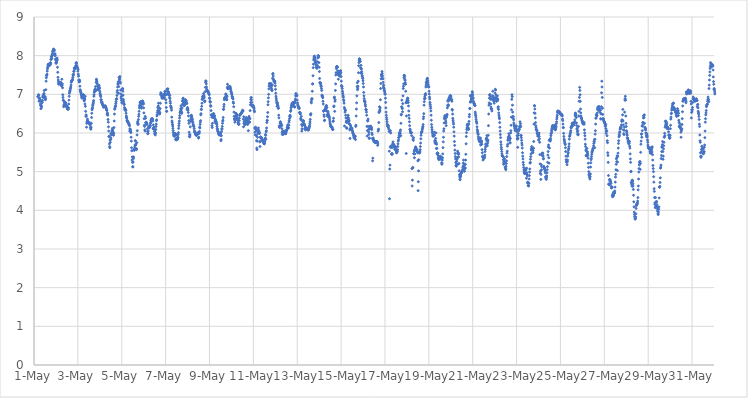
| Category | Series 0 |
|---|---|
| 44317.166666666664 | 6.94 |
| 44317.208333333336 | 6.99 |
| 44317.21875 | 6.98 |
| 44317.229166666664 | 6.82 |
| 44317.239583333336 | 6.89 |
| 44317.25 | 6.91 |
| 44317.260416666664 | 6.85 |
| 44317.270833333336 | 6.83 |
| 44317.28125 | 6.86 |
| 44317.291666666664 | 6.75 |
| 44317.302083333336 | 6.71 |
| 44317.3125 | 6.63 |
| 44317.322916666664 | 6.72 |
| 44317.333333333336 | 6.65 |
| 44317.34375 | 6.69 |
| 44317.354166666664 | 6.78 |
| 44317.364583333336 | 6.83 |
| 44317.375 | 6.79 |
| 44317.385416666664 | 6.84 |
| 44317.395833333336 | 6.93 |
| 44317.40625 | 6.93 |
| 44317.416666666664 | 6.97 |
| 44317.427083333336 | 6.93 |
| 44317.4375 | 6.96 |
| 44317.447916666664 | 7.01 |
| 44317.458333333336 | 7.02 |
| 44317.46875 | 7.1 |
| 44317.479166666664 | 6.93 |
| 44317.489583333336 | 6.89 |
| 44317.5 | 6.91 |
| 44317.510416666664 | 6.94 |
| 44317.520833333336 | 6.86 |
| 44317.53125 | 6.89 |
| 44317.541666666664 | 7.12 |
| 44317.552083333336 | 7.34 |
| 44317.5625 | 7.43 |
| 44317.572916666664 | 7.48 |
| 44317.583333333336 | 7.5 |
| 44317.59375 | 7.52 |
| 44317.604166666664 | 7.6 |
| 44317.614583333336 | 7.66 |
| 44317.625 | 7.7 |
| 44317.635416666664 | 7.73 |
| 44317.645833333336 | 7.77 |
| 44317.65625 | 7.78 |
| 44317.666666666664 | 7.77 |
| 44317.677083333336 | 7.76 |
| 44317.6875 | 7.78 |
| 44317.697916666664 | 7.76 |
| 44317.708333333336 | 7.75 |
| 44317.71875 | 7.76 |
| 44317.729166666664 | 7.76 |
| 44317.739583333336 | 7.77 |
| 44317.75 | 7.82 |
| 44317.760416666664 | 7.8 |
| 44317.770833333336 | 7.9 |
| 44317.78125 | 7.91 |
| 44317.791666666664 | 7.97 |
| 44317.802083333336 | 7.98 |
| 44317.8125 | 7.93 |
| 44317.822916666664 | 8 |
| 44317.833333333336 | 8.03 |
| 44317.84375 | 8.06 |
| 44317.854166666664 | 8.12 |
| 44317.864583333336 | 8.11 |
| 44317.875 | 8.14 |
| 44317.885416666664 | 8.17 |
| 44317.895833333336 | 8.14 |
| 44317.90625 | 8.16 |
| 44317.916666666664 | 8.15 |
| 44317.927083333336 | 8.13 |
| 44317.9375 | 8.01 |
| 44317.947916666664 | 8.04 |
| 44317.958333333336 | 8.05 |
| 44317.96875 | 8 |
| 44317.979166666664 | 7.91 |
| 44317.989583333336 | 7.89 |
| 44318.0 | 7.82 |
| 44318.010416666664 | 7.8 |
| 44318.020833333336 | 7.82 |
| 44318.03125 | 7.85 |
| 44318.041666666664 | 7.91 |
| 44318.052083333336 | 7.94 |
| 44318.0625 | 7.89 |
| 44318.072916666664 | 7.7 |
| 44318.083333333336 | 7.57 |
| 44318.09375 | 7.44 |
| 44318.104166666664 | 7.37 |
| 44318.114583333336 | 7.32 |
| 44318.125 | 7.27 |
| 44318.135416666664 | 7.26 |
| 44318.145833333336 | 7.29 |
| 44318.15625 | 7.3 |
| 44318.166666666664 | 7.31 |
| 44318.177083333336 | 7.31 |
| 44318.1875 | 7.3 |
| 44318.197916666664 | 7.3 |
| 44318.208333333336 | 7.3 |
| 44318.21875 | 7.31 |
| 44318.229166666664 | 7.27 |
| 44318.239583333336 | 7.24 |
| 44318.25 | 7.22 |
| 44318.260416666664 | 7.25 |
| 44318.270833333336 | 7.39 |
| 44318.28125 | 7.23 |
| 44318.291666666664 | 7.27 |
| 44318.302083333336 | 7.17 |
| 44318.3125 | 6.99 |
| 44318.322916666664 | 6.92 |
| 44318.333333333336 | 6.85 |
| 44318.34375 | 6.84 |
| 44318.354166666664 | 6.68 |
| 44318.364583333336 | 6.71 |
| 44318.375 | 6.74 |
| 44318.385416666664 | 6.81 |
| 44318.395833333336 | 6.76 |
| 44318.40625 | 6.8 |
| 44318.416666666664 | 6.79 |
| 44318.427083333336 | 6.78 |
| 44318.4375 | 6.78 |
| 44318.447916666664 | 6.78 |
| 44318.458333333336 | 6.73 |
| 44318.46875 | 6.71 |
| 44318.479166666664 | 6.68 |
| 44318.489583333336 | 6.68 |
| 44318.5 | 6.69 |
| 44318.510416666664 | 6.69 |
| 44318.520833333336 | 6.63 |
| 44318.53125 | 6.63 |
| 44318.541666666664 | 6.62 |
| 44318.552083333336 | 6.61 |
| 44318.5625 | 6.62 |
| 44318.572916666664 | 6.65 |
| 44318.583333333336 | 6.75 |
| 44318.59375 | 6.85 |
| 44318.604166666664 | 6.95 |
| 44318.614583333336 | 7.03 |
| 44318.625 | 7.06 |
| 44318.635416666664 | 7.09 |
| 44318.645833333336 | 7.09 |
| 44318.65625 | 7.14 |
| 44318.666666666664 | 7.16 |
| 44318.677083333336 | 7.19 |
| 44318.6875 | 7.24 |
| 44318.697916666664 | 7.31 |
| 44318.708333333336 | 7.34 |
| 44318.71875 | 7.36 |
| 44318.729166666664 | 7.36 |
| 44318.739583333336 | 7.36 |
| 44318.75 | 7.37 |
| 44318.760416666664 | 7.39 |
| 44318.770833333336 | 7.44 |
| 44318.78125 | 7.51 |
| 44318.791666666664 | 7.49 |
| 44318.802083333336 | 7.52 |
| 44318.8125 | 7.59 |
| 44318.822916666664 | 7.6 |
| 44318.833333333336 | 7.68 |
| 44318.84375 | 7.68 |
| 44318.854166666664 | 7.65 |
| 44318.864583333336 | 7.66 |
| 44318.875 | 7.69 |
| 44318.885416666664 | 7.7 |
| 44318.895833333336 | 7.69 |
| 44318.90625 | 7.74 |
| 44318.916666666664 | 7.8 |
| 44318.927083333336 | 7.82 |
| 44318.9375 | 7.81 |
| 44318.947916666664 | 7.75 |
| 44318.958333333336 | 7.72 |
| 44318.96875 | 7.69 |
| 44318.979166666664 | 7.69 |
| 44318.989583333336 | 7.67 |
| 44319.0 | 7.6 |
| 44319.010416666664 | 7.64 |
| 44319.020833333336 | 7.52 |
| 44319.03125 | 7.47 |
| 44319.041666666664 | 7.37 |
| 44319.052083333336 | 7.32 |
| 44319.0625 | 7.35 |
| 44319.072916666664 | 7.37 |
| 44319.083333333336 | 7.33 |
| 44319.09375 | 7.21 |
| 44319.104166666664 | 7.12 |
| 44319.114583333336 | 7.09 |
| 44319.125 | 7.07 |
| 44319.135416666664 | 7.05 |
| 44319.145833333336 | 7.01 |
| 44319.15625 | 6.99 |
| 44319.166666666664 | 6.96 |
| 44319.177083333336 | 6.92 |
| 44319.1875 | 6.9 |
| 44319.197916666664 | 6.94 |
| 44319.208333333336 | 6.97 |
| 44319.21875 | 6.98 |
| 44319.229166666664 | 6.98 |
| 44319.239583333336 | 6.99 |
| 44319.25 | 6.99 |
| 44319.260416666664 | 6.98 |
| 44319.270833333336 | 6.91 |
| 44319.28125 | 6.85 |
| 44319.291666666664 | 6.83 |
| 44319.302083333336 | 6.9 |
| 44319.3125 | 6.87 |
| 44319.322916666664 | 6.75 |
| 44319.333333333336 | 6.95 |
| 44319.34375 | 6.69 |
| 44319.354166666664 | 6.56 |
| 44319.364583333336 | 6.43 |
| 44319.375 | 6.47 |
| 44319.385416666664 | 6.44 |
| 44319.395833333336 | 6.15 |
| 44319.40625 | 6.25 |
| 44319.416666666664 | 6.29 |
| 44319.427083333336 | 6.31 |
| 44319.4375 | 6.36 |
| 44319.447916666664 | 6.31 |
| 44319.458333333336 | 6.3 |
| 44319.46875 | 6.26 |
| 44319.479166666664 | 6.26 |
| 44319.489583333336 | 6.26 |
| 44319.5 | 6.26 |
| 44319.510416666664 | 6.26 |
| 44319.520833333336 | 6.26 |
| 44319.53125 | 6.27 |
| 44319.541666666664 | 6.24 |
| 44319.552083333336 | 6.23 |
| 44319.5625 | 6.21 |
| 44319.572916666664 | 6.15 |
| 44319.583333333336 | 6.11 |
| 44319.59375 | 6.1 |
| 44319.604166666664 | 6.15 |
| 44319.614583333336 | 6.25 |
| 44319.625 | 6.4 |
| 44319.635416666664 | 6.51 |
| 44319.645833333336 | 6.6 |
| 44319.65625 | 6.63 |
| 44319.666666666664 | 6.66 |
| 44319.677083333336 | 6.71 |
| 44319.6875 | 6.73 |
| 44319.697916666664 | 6.77 |
| 44319.708333333336 | 6.8 |
| 44319.71875 | 6.84 |
| 44319.729166666664 | 6.95 |
| 44319.739583333336 | 6.99 |
| 44319.75 | 7.05 |
| 44319.760416666664 | 7.08 |
| 44319.770833333336 | 7.11 |
| 44319.78125 | 7.12 |
| 44319.791666666664 | 7.14 |
| 44319.802083333336 | 7.2 |
| 44319.8125 | 7.1 |
| 44319.822916666664 | 7.1 |
| 44319.833333333336 | 7.31 |
| 44319.84375 | 7.39 |
| 44319.854166666664 | 7.37 |
| 44319.864583333336 | 7.34 |
| 44319.875 | 7.29 |
| 44319.885416666664 | 7.27 |
| 44319.895833333336 | 7.21 |
| 44319.90625 | 7.12 |
| 44319.916666666664 | 7.14 |
| 44319.927083333336 | 7.13 |
| 44319.9375 | 7.18 |
| 44319.947916666664 | 7.14 |
| 44319.958333333336 | 7.18 |
| 44319.96875 | 7.23 |
| 44319.979166666664 | 7.18 |
| 44319.989583333336 | 7.15 |
| 44320.0 | 7.08 |
| 44320.010416666664 | 7.03 |
| 44320.020833333336 | 6.99 |
| 44320.03125 | 6.97 |
| 44320.041666666664 | 6.94 |
| 44320.052083333336 | 6.86 |
| 44320.0625 | 6.86 |
| 44320.072916666664 | 6.79 |
| 44320.083333333336 | 6.79 |
| 44320.09375 | 6.8 |
| 44320.104166666664 | 6.8 |
| 44320.114583333336 | 6.76 |
| 44320.125 | 6.74 |
| 44320.135416666664 | 6.72 |
| 44320.145833333336 | 6.72 |
| 44320.15625 | 6.7 |
| 44320.166666666664 | 6.68 |
| 44320.177083333336 | 6.67 |
| 44320.1875 | 6.67 |
| 44320.197916666664 | 6.68 |
| 44320.208333333336 | 6.7 |
| 44320.21875 | 6.69 |
| 44320.229166666664 | 6.69 |
| 44320.239583333336 | 6.68 |
| 44320.25 | 6.69 |
| 44320.260416666664 | 6.7 |
| 44320.270833333336 | 6.67 |
| 44320.28125 | 6.66 |
| 44320.291666666664 | 6.64 |
| 44320.302083333336 | 6.6 |
| 44320.3125 | 6.6 |
| 44320.322916666664 | 6.58 |
| 44320.333333333336 | 6.48 |
| 44320.34375 | 6.51 |
| 44320.354166666664 | 6.51 |
| 44320.364583333336 | 6.46 |
| 44320.375 | 6.35 |
| 44320.385416666664 | 6.28 |
| 44320.395833333336 | 6.16 |
| 44320.40625 | 6.05 |
| 44320.416666666664 | 5.91 |
| 44320.427083333336 | 5.91 |
| 44320.4375 | 5.72 |
| 44320.447916666664 | 5.65 |
| 44320.458333333336 | 5.62 |
| 44320.46875 | 5.82 |
| 44320.479166666664 | 5.76 |
| 44320.489583333336 | 5.83 |
| 44320.5 | 5.98 |
| 44320.510416666664 | 5.87 |
| 44320.520833333336 | 5.97 |
| 44320.53125 | 5.95 |
| 44320.541666666664 | 5.99 |
| 44320.552083333336 | 6.04 |
| 44320.5625 | 6.07 |
| 44320.572916666664 | 6.12 |
| 44320.583333333336 | 6.08 |
| 44320.59375 | 6.05 |
| 44320.604166666664 | 6.01 |
| 44320.614583333336 | 5.97 |
| 44320.625 | 5.94 |
| 44320.635416666664 | 6 |
| 44320.645833333336 | 6.14 |
| 44320.65625 | 6.31 |
| 44320.666666666664 | 6.49 |
| 44320.677083333336 | 6.62 |
| 44320.6875 | 6.62 |
| 44320.697916666664 | 6.67 |
| 44320.708333333336 | 6.68 |
| 44320.71875 | 6.71 |
| 44320.729166666664 | 6.76 |
| 44320.739583333336 | 6.81 |
| 44320.75 | 6.87 |
| 44320.760416666664 | 6.87 |
| 44320.770833333336 | 6.89 |
| 44320.78125 | 6.97 |
| 44320.791666666664 | 7.05 |
| 44320.802083333336 | 7.1 |
| 44320.8125 | 7.19 |
| 44320.822916666664 | 7.26 |
| 44320.833333333336 | 7.32 |
| 44320.84375 | 7.28 |
| 44320.854166666664 | 7.03 |
| 44320.864583333336 | 7.2 |
| 44320.875 | 7.44 |
| 44320.885416666664 | 7.37 |
| 44320.895833333336 | 7.39 |
| 44320.90625 | 7.42 |
| 44320.916666666664 | 7.46 |
| 44320.927083333336 | 7.32 |
| 44320.9375 | 7.29 |
| 44320.947916666664 | 7.11 |
| 44320.958333333336 | 7.01 |
| 44320.96875 | 6.93 |
| 44320.979166666664 | 6.89 |
| 44320.989583333336 | 6.84 |
| 44321.0 | 6.78 |
| 44321.010416666664 | 6.96 |
| 44321.020833333336 | 7.13 |
| 44321.03125 | 7.14 |
| 44321.041666666664 | 7.15 |
| 44321.052083333336 | 7.08 |
| 44321.0625 | 6.98 |
| 44321.072916666664 | 6.87 |
| 44321.083333333336 | 6.82 |
| 44321.09375 | 6.77 |
| 44321.104166666664 | 6.74 |
| 44321.114583333336 | 6.74 |
| 44321.125 | 6.66 |
| 44321.135416666664 | 6.62 |
| 44321.145833333336 | 6.6 |
| 44321.15625 | 6.59 |
| 44321.166666666664 | 6.61 |
| 44321.177083333336 | 6.61 |
| 44321.1875 | 6.58 |
| 44321.197916666664 | 6.51 |
| 44321.208333333336 | 6.44 |
| 44321.21875 | 6.41 |
| 44321.229166666664 | 6.38 |
| 44321.239583333336 | 6.33 |
| 44321.25 | 6.31 |
| 44321.260416666664 | 6.31 |
| 44321.270833333336 | 6.29 |
| 44321.28125 | 6.28 |
| 44321.291666666664 | 6.28 |
| 44321.302083333336 | 6.26 |
| 44321.3125 | 6.25 |
| 44321.322916666664 | 6.24 |
| 44321.333333333336 | 6.22 |
| 44321.34375 | 6.2 |
| 44321.354166666664 | 6.19 |
| 44321.364583333336 | 6.05 |
| 44321.375 | 6.11 |
| 44321.385416666664 | 6.09 |
| 44321.395833333336 | 6.07 |
| 44321.40625 | 6.04 |
| 44321.416666666664 | 6.01 |
| 44321.427083333336 | 5.89 |
| 44321.4375 | 5.79 |
| 44321.447916666664 | 5.62 |
| 44321.458333333336 | 5.54 |
| 44321.46875 | 5.3 |
| 44321.479166666664 | 5.38 |
| 44321.489583333336 | 5.24 |
| 44321.5 | 5.13 |
| 44321.510416666664 | 5.12 |
| 44321.520833333336 | 5.25 |
| 44321.53125 | 5.34 |
| 44321.541666666664 | 5.38 |
| 44321.552083333336 | 5.57 |
| 44321.5625 | 5.56 |
| 44321.572916666664 | 5.55 |
| 44321.583333333336 | 5.59 |
| 44321.59375 | 5.64 |
| 44321.604166666664 | 5.69 |
| 44321.614583333336 | 5.8 |
| 44321.625 | 5.8 |
| 44321.635416666664 | 5.69 |
| 44321.645833333336 | 5.71 |
| 44321.65625 | 5.59 |
| 44321.666666666664 | 5.57 |
| 44321.677083333336 | 5.59 |
| 44321.6875 | 5.75 |
| 44321.697916666664 | 5.95 |
| 44321.708333333336 | 6.06 |
| 44321.71875 | 6.26 |
| 44321.729166666664 | 6.3 |
| 44321.739583333336 | 6.22 |
| 44321.75 | 6.24 |
| 44321.760416666664 | 6.35 |
| 44321.770833333336 | 6.43 |
| 44321.78125 | 6.48 |
| 44321.791666666664 | 6.56 |
| 44321.802083333336 | 6.65 |
| 44321.8125 | 6.7 |
| 44321.822916666664 | 6.72 |
| 44321.833333333336 | 6.78 |
| 44321.84375 | 6.8 |
| 44321.854166666664 | 6.79 |
| 44321.864583333336 | 6.81 |
| 44321.875 | 6.8 |
| 44321.885416666664 | 6.77 |
| 44321.895833333336 | 6.64 |
| 44321.90625 | 6.68 |
| 44321.916666666664 | 6.74 |
| 44321.927083333336 | 6.79 |
| 44321.9375 | 6.78 |
| 44321.947916666664 | 6.83 |
| 44321.958333333336 | 6.82 |
| 44321.96875 | 6.76 |
| 44321.979166666664 | 6.78 |
| 44321.989583333336 | 6.75 |
| 44322.0 | 6.65 |
| 44322.010416666664 | 6.52 |
| 44322.020833333336 | 6.37 |
| 44322.03125 | 6.2 |
| 44322.041666666664 | 6.17 |
| 44322.052083333336 | 6.08 |
| 44322.0625 | 6.05 |
| 44322.072916666664 | 6.43 |
| 44322.083333333336 | 6.38 |
| 44322.09375 | 6.27 |
| 44322.104166666664 | 6.26 |
| 44322.114583333336 | 6.28 |
| 44322.125 | 6.27 |
| 44322.135416666664 | 6.23 |
| 44322.145833333336 | 6.24 |
| 44322.15625 | 6.22 |
| 44322.166666666664 | 6.11 |
| 44322.177083333336 | 6.04 |
| 44322.1875 | 5.98 |
| 44322.197916666664 | 5.99 |
| 44322.208333333336 | 6.05 |
| 44322.21875 | 6.14 |
| 44322.229166666664 | 6.15 |
| 44322.239583333336 | 6.15 |
| 44322.25 | 6.13 |
| 44322.260416666664 | 6.17 |
| 44322.270833333336 | 6.17 |
| 44322.28125 | 6.16 |
| 44322.291666666664 | 6.17 |
| 44322.302083333336 | 6.2 |
| 44322.3125 | 6.25 |
| 44322.322916666664 | 6.28 |
| 44322.333333333336 | 6.32 |
| 44322.34375 | 6.36 |
| 44322.354166666664 | 6.36 |
| 44322.364583333336 | 6.36 |
| 44322.375 | 6.34 |
| 44322.385416666664 | 6.36 |
| 44322.395833333336 | 6.37 |
| 44322.40625 | 6.36 |
| 44322.416666666664 | 6.31 |
| 44322.427083333336 | 6.11 |
| 44322.4375 | 6.21 |
| 44322.447916666664 | 6.12 |
| 44322.458333333336 | 6.14 |
| 44322.46875 | 6.15 |
| 44322.479166666664 | 6.1 |
| 44322.489583333336 | 6.04 |
| 44322.5 | 5.98 |
| 44322.510416666664 | 6.05 |
| 44322.520833333336 | 6 |
| 44322.53125 | 5.95 |
| 44322.541666666664 | 6 |
| 44322.552083333336 | 6.09 |
| 44322.5625 | 6.17 |
| 44322.572916666664 | 6.23 |
| 44322.583333333336 | 6.32 |
| 44322.59375 | 6.34 |
| 44322.604166666664 | 6.44 |
| 44322.614583333336 | 6.47 |
| 44322.625 | 6.53 |
| 44322.635416666664 | 6.58 |
| 44322.645833333336 | 6.66 |
| 44322.65625 | 6.67 |
| 44322.666666666664 | 6.7 |
| 44322.677083333336 | 6.77 |
| 44322.6875 | 6.65 |
| 44322.697916666664 | 6.58 |
| 44322.708333333336 | 6.55 |
| 44322.71875 | 6.51 |
| 44322.729166666664 | 6.49 |
| 44322.739583333336 | 6.52 |
| 44322.75 | 6.63 |
| 44322.760416666664 | 6.77 |
| 44322.770833333336 | 6.99 |
| 44322.78125 | 7.04 |
| 44322.791666666664 | 7.03 |
| 44322.802083333336 | 7.01 |
| 44322.8125 | 6.99 |
| 44322.822916666664 | 6.94 |
| 44322.833333333336 | 6.91 |
| 44322.84375 | 6.9 |
| 44322.854166666664 | 6.93 |
| 44322.864583333336 | 6.91 |
| 44322.875 | 6.93 |
| 44322.885416666664 | 6.95 |
| 44322.895833333336 | 6.93 |
| 44322.90625 | 6.95 |
| 44322.916666666664 | 6.9 |
| 44322.927083333336 | 6.99 |
| 44322.9375 | 7 |
| 44322.947916666664 | 6.91 |
| 44322.958333333336 | 7.02 |
| 44322.96875 | 7.07 |
| 44322.979166666664 | 7.08 |
| 44322.989583333336 | 7.03 |
| 44323.0 | 6.98 |
| 44323.010416666664 | 6.86 |
| 44323.020833333336 | 6.78 |
| 44323.03125 | 6.66 |
| 44323.041666666664 | 6.56 |
| 44323.052083333336 | 6.56 |
| 44323.0625 | 7.13 |
| 44323.072916666664 | 7 |
| 44323.083333333336 | 7.08 |
| 44323.09375 | 7.14 |
| 44323.104166666664 | 7.14 |
| 44323.114583333336 | 7.07 |
| 44323.125 | 7.04 |
| 44323.135416666664 | 7.06 |
| 44323.145833333336 | 7.01 |
| 44323.15625 | 7.01 |
| 44323.166666666664 | 6.98 |
| 44323.177083333336 | 6.92 |
| 44323.1875 | 6.97 |
| 44323.197916666664 | 6.89 |
| 44323.208333333336 | 6.82 |
| 44323.21875 | 6.77 |
| 44323.229166666664 | 6.7 |
| 44323.239583333336 | 6.69 |
| 44323.25 | 6.66 |
| 44323.260416666664 | 6.64 |
| 44323.270833333336 | 6.59 |
| 44323.28125 | 6.41 |
| 44323.291666666664 | 6.31 |
| 44323.302083333336 | 6.27 |
| 44323.3125 | 6.22 |
| 44323.322916666664 | 6.18 |
| 44323.333333333336 | 6.12 |
| 44323.34375 | 6.06 |
| 44323.354166666664 | 6.01 |
| 44323.364583333336 | 5.96 |
| 44323.375 | 5.93 |
| 44323.385416666664 | 5.92 |
| 44323.395833333336 | 5.92 |
| 44323.40625 | 5.94 |
| 44323.416666666664 | 5.97 |
| 44323.427083333336 | 5.98 |
| 44323.4375 | 5.99 |
| 44323.447916666664 | 5.95 |
| 44323.458333333336 | 5.83 |
| 44323.46875 | 5.83 |
| 44323.479166666664 | 5.86 |
| 44323.489583333336 | 5.82 |
| 44323.5 | 5.95 |
| 44323.510416666664 | 5.96 |
| 44323.520833333336 | 5.83 |
| 44323.53125 | 5.86 |
| 44323.541666666664 | 5.84 |
| 44323.552083333336 | 5.89 |
| 44323.5625 | 5.88 |
| 44323.572916666664 | 5.96 |
| 44323.583333333336 | 6.01 |
| 44323.59375 | 6.12 |
| 44323.604166666664 | 6.19 |
| 44323.614583333336 | 6.25 |
| 44323.625 | 6.31 |
| 44323.635416666664 | 6.39 |
| 44323.645833333336 | 6.45 |
| 44323.65625 | 6.52 |
| 44323.666666666664 | 6.54 |
| 44323.677083333336 | 6.57 |
| 44323.6875 | 6.63 |
| 44323.697916666664 | 6.7 |
| 44323.708333333336 | 6.6 |
| 44323.71875 | 6.56 |
| 44323.729166666664 | 6.51 |
| 44323.739583333336 | 6.52 |
| 44323.75 | 6.65 |
| 44323.760416666664 | 6.74 |
| 44323.770833333336 | 6.82 |
| 44323.78125 | 6.85 |
| 44323.791666666664 | 6.89 |
| 44323.802083333336 | 6.9 |
| 44323.8125 | 6.81 |
| 44323.822916666664 | 6.77 |
| 44323.833333333336 | 6.73 |
| 44323.84375 | 6.71 |
| 44323.854166666664 | 6.71 |
| 44323.864583333336 | 6.73 |
| 44323.875 | 6.76 |
| 44323.885416666664 | 6.8 |
| 44323.895833333336 | 6.84 |
| 44323.90625 | 6.86 |
| 44323.916666666664 | 6.85 |
| 44323.927083333336 | 6.84 |
| 44323.9375 | 6.83 |
| 44323.947916666664 | 6.79 |
| 44323.958333333336 | 6.78 |
| 44323.96875 | 6.76 |
| 44323.979166666664 | 6.61 |
| 44323.989583333336 | 6.63 |
| 44324.0 | 6.66 |
| 44324.010416666664 | 6.63 |
| 44324.020833333336 | 6.59 |
| 44324.03125 | 6.53 |
| 44324.041666666664 | 6.44 |
| 44324.052083333336 | 6.32 |
| 44324.0625 | 6.25 |
| 44324.072916666664 | 6.02 |
| 44324.083333333336 | 5.91 |
| 44324.09375 | 5.96 |
| 44324.104166666664 | 5.9 |
| 44324.114583333336 | 5.95 |
| 44324.125 | 6.16 |
| 44324.135416666664 | 6.3 |
| 44324.145833333336 | 6.36 |
| 44324.15625 | 6.43 |
| 44324.166666666664 | 6.46 |
| 44324.177083333336 | 6.39 |
| 44324.1875 | 6.45 |
| 44324.197916666664 | 6.4 |
| 44324.208333333336 | 6.34 |
| 44324.21875 | 6.36 |
| 44324.229166666664 | 6.3 |
| 44324.239583333336 | 6.27 |
| 44324.25 | 6.23 |
| 44324.260416666664 | 6.2 |
| 44324.270833333336 | 6.2 |
| 44324.28125 | 6.18 |
| 44324.291666666664 | 6.16 |
| 44324.302083333336 | 6.11 |
| 44324.3125 | 6.05 |
| 44324.322916666664 | 6.02 |
| 44324.333333333336 | 6.01 |
| 44324.34375 | 6.03 |
| 44324.354166666664 | 6 |
| 44324.364583333336 | 5.97 |
| 44324.375 | 5.95 |
| 44324.385416666664 | 5.95 |
| 44324.395833333336 | 5.95 |
| 44324.40625 | 5.95 |
| 44324.416666666664 | 5.94 |
| 44324.427083333336 | 5.95 |
| 44324.4375 | 5.96 |
| 44324.447916666664 | 5.98 |
| 44324.458333333336 | 5.99 |
| 44324.46875 | 6 |
| 44324.479166666664 | 5.99 |
| 44324.489583333336 | 5.99 |
| 44324.5 | 5.87 |
| 44324.510416666664 | 5.89 |
| 44324.520833333336 | 6.02 |
| 44324.53125 | 5.99 |
| 44324.541666666664 | 6.04 |
| 44324.552083333336 | 6.15 |
| 44324.5625 | 6.13 |
| 44324.572916666664 | 6.22 |
| 44324.583333333336 | 6.28 |
| 44324.59375 | 6.32 |
| 44324.604166666664 | 6.47 |
| 44324.614583333336 | 6.5 |
| 44324.625 | 6.61 |
| 44324.635416666664 | 6.61 |
| 44324.645833333336 | 6.69 |
| 44324.65625 | 6.77 |
| 44324.666666666664 | 6.87 |
| 44324.677083333336 | 6.88 |
| 44324.6875 | 6.93 |
| 44324.697916666664 | 6.95 |
| 44324.708333333336 | 6.95 |
| 44324.71875 | 6.91 |
| 44324.729166666664 | 7.02 |
| 44324.739583333336 | 6.97 |
| 44324.75 | 6.95 |
| 44324.760416666664 | 6.91 |
| 44324.770833333336 | 6.82 |
| 44324.78125 | 6.81 |
| 44324.791666666664 | 6.83 |
| 44324.802083333336 | 7.07 |
| 44324.8125 | 7.18 |
| 44324.822916666664 | 7.31 |
| 44324.833333333336 | 7.35 |
| 44324.84375 | 7.33 |
| 44324.854166666664 | 7.27 |
| 44324.864583333336 | 7.19 |
| 44324.875 | 7.13 |
| 44324.885416666664 | 7.11 |
| 44324.895833333336 | 7.09 |
| 44324.90625 | 7.09 |
| 44324.916666666664 | 7.08 |
| 44324.927083333336 | 7.08 |
| 44324.9375 | 7.05 |
| 44324.947916666664 | 7.05 |
| 44324.958333333336 | 7.04 |
| 44324.96875 | 7.03 |
| 44324.979166666664 | 7.01 |
| 44324.989583333336 | 6.99 |
| 44325.0 | 6.91 |
| 44325.010416666664 | 6.89 |
| 44325.020833333336 | 6.82 |
| 44325.03125 | 6.8 |
| 44325.041666666664 | 6.8 |
| 44325.052083333336 | 6.71 |
| 44325.0625 | 6.69 |
| 44325.072916666664 | 6.58 |
| 44325.083333333336 | 6.47 |
| 44325.09375 | 6.47 |
| 44325.104166666664 | 6.41 |
| 44325.114583333336 | 6.19 |
| 44325.125 | 6.14 |
| 44325.135416666664 | 6.25 |
| 44325.145833333336 | 6.42 |
| 44325.15625 | 6.42 |
| 44325.166666666664 | 6.4 |
| 44325.177083333336 | 6.5 |
| 44325.1875 | 6.5 |
| 44325.197916666664 | 6.49 |
| 44325.208333333336 | 6.46 |
| 44325.21875 | 6.45 |
| 44325.229166666664 | 6.43 |
| 44325.239583333336 | 6.38 |
| 44325.25 | 6.31 |
| 44325.260416666664 | 6.27 |
| 44325.270833333336 | 6.35 |
| 44325.28125 | 6.33 |
| 44325.291666666664 | 6.29 |
| 44325.302083333336 | 6.3 |
| 44325.3125 | 6.26 |
| 44325.322916666664 | 6.25 |
| 44325.333333333336 | 6.22 |
| 44325.34375 | 6.17 |
| 44325.354166666664 | 6.12 |
| 44325.364583333336 | 6.09 |
| 44325.375 | 6.06 |
| 44325.385416666664 | 6.04 |
| 44325.395833333336 | 6.03 |
| 44325.40625 | 6 |
| 44325.416666666664 | 5.99 |
| 44325.427083333336 | 5.96 |
| 44325.4375 | 5.95 |
| 44325.447916666664 | 5.95 |
| 44325.458333333336 | 5.96 |
| 44325.46875 | 5.98 |
| 44325.479166666664 | 5.99 |
| 44325.489583333336 | 6 |
| 44325.5 | 5.99 |
| 44325.510416666664 | 5.94 |
| 44325.520833333336 | 5.8 |
| 44325.53125 | 5.83 |
| 44325.541666666664 | 5.93 |
| 44325.552083333336 | 6.04 |
| 44325.5625 | 6.1 |
| 44325.572916666664 | 6.11 |
| 44325.583333333336 | 6.17 |
| 44325.59375 | 6.25 |
| 44325.604166666664 | 6.31 |
| 44325.614583333336 | 6.33 |
| 44325.625 | 6.4 |
| 44325.635416666664 | 6.61 |
| 44325.645833333336 | 6.61 |
| 44325.65625 | 6.68 |
| 44325.666666666664 | 6.74 |
| 44325.677083333336 | 6.86 |
| 44325.6875 | 6.91 |
| 44325.697916666664 | 6.89 |
| 44325.708333333336 | 6.92 |
| 44325.71875 | 6.88 |
| 44325.729166666664 | 6.91 |
| 44325.739583333336 | 7 |
| 44325.75 | 7.01 |
| 44325.760416666664 | 6.97 |
| 44325.770833333336 | 6.91 |
| 44325.78125 | 6.87 |
| 44325.791666666664 | 6.86 |
| 44325.802083333336 | 6.95 |
| 44325.8125 | 7.17 |
| 44325.822916666664 | 7.26 |
| 44325.833333333336 | 7.19 |
| 44325.84375 | 7.14 |
| 44325.854166666664 | 7.15 |
| 44325.864583333336 | 7.15 |
| 44325.875 | 7.16 |
| 44325.885416666664 | 7.19 |
| 44325.895833333336 | 7.19 |
| 44325.90625 | 7.2 |
| 44325.916666666664 | 7.2 |
| 44325.927083333336 | 7.19 |
| 44325.9375 | 7.2 |
| 44325.947916666664 | 7.17 |
| 44325.958333333336 | 7.15 |
| 44325.96875 | 7.12 |
| 44325.979166666664 | 7.08 |
| 44325.989583333336 | 7.06 |
| 44326.0 | 7.04 |
| 44326.010416666664 | 7.01 |
| 44326.020833333336 | 6.99 |
| 44326.03125 | 6.95 |
| 44326.041666666664 | 6.91 |
| 44326.052083333336 | 6.93 |
| 44326.0625 | 6.9 |
| 44326.072916666664 | 6.88 |
| 44326.083333333336 | 6.8 |
| 44326.09375 | 6.77 |
| 44326.104166666664 | 6.68 |
| 44326.114583333336 | 6.54 |
| 44326.125 | 6.43 |
| 44326.135416666664 | 6.36 |
| 44326.145833333336 | 6.37 |
| 44326.15625 | 6.28 |
| 44326.166666666664 | 6.32 |
| 44326.177083333336 | 6.37 |
| 44326.1875 | 6.43 |
| 44326.197916666664 | 6.51 |
| 44326.208333333336 | 6.5 |
| 44326.21875 | 6.49 |
| 44326.229166666664 | 6.48 |
| 44326.239583333336 | 6.47 |
| 44326.25 | 6.44 |
| 44326.260416666664 | 6.4 |
| 44326.270833333336 | 6.38 |
| 44326.28125 | 6.35 |
| 44326.291666666664 | 6.32 |
| 44326.302083333336 | 6.27 |
| 44326.3125 | 6.24 |
| 44326.322916666664 | 6.23 |
| 44326.333333333336 | 6.22 |
| 44326.34375 | 6.24 |
| 44326.354166666664 | 6.32 |
| 44326.364583333336 | 6.38 |
| 44326.375 | 6.45 |
| 44326.385416666664 | 6.47 |
| 44326.395833333336 | 6.48 |
| 44326.40625 | 6.48 |
| 44326.416666666664 | 6.49 |
| 44326.427083333336 | 6.49 |
| 44326.4375 | 6.5 |
| 44326.447916666664 | 6.5 |
| 44326.458333333336 | 6.52 |
| 44326.46875 | 6.53 |
| 44326.479166666664 | 6.54 |
| 44326.489583333336 | 6.56 |
| 44326.5 | 6.57 |
| 44326.510416666664 | 6.59 |
| 44326.520833333336 | 6.57 |
| 44326.53125 | 6.57 |
| 44326.541666666664 | 6.36 |
| 44326.552083333336 | 6.16 |
| 44326.5625 | 6.42 |
| 44326.572916666664 | 6.25 |
| 44326.583333333336 | 6.3 |
| 44326.59375 | 6.25 |
| 44326.604166666664 | 6.22 |
| 44326.614583333336 | 6.25 |
| 44326.625 | 6.33 |
| 44326.635416666664 | 6.26 |
| 44326.645833333336 | 6.22 |
| 44326.65625 | 6.38 |
| 44326.666666666664 | 6.28 |
| 44326.677083333336 | 6.4 |
| 44326.6875 | 6.37 |
| 44326.697916666664 | 6.32 |
| 44326.708333333336 | 6.34 |
| 44326.71875 | 6.3 |
| 44326.729166666664 | 6.35 |
| 44326.739583333336 | 6.22 |
| 44326.75 | 6.24 |
| 44326.760416666664 | 6.29 |
| 44326.770833333336 | 6.06 |
| 44326.78125 | 6.3 |
| 44326.791666666664 | 6.4 |
| 44326.802083333336 | 6.43 |
| 44326.8125 | 6.38 |
| 44326.822916666664 | 6.29 |
| 44326.833333333336 | 6.28 |
| 44326.84375 | 6.37 |
| 44326.854166666664 | 6.58 |
| 44326.864583333336 | 6.73 |
| 44326.875 | 6.79 |
| 44326.885416666664 | 6.87 |
| 44326.895833333336 | 6.91 |
| 44326.90625 | 6.92 |
| 44326.916666666664 | 6.86 |
| 44326.927083333336 | 6.79 |
| 44326.9375 | 6.71 |
| 44326.947916666664 | 6.69 |
| 44326.958333333336 | 6.71 |
| 44326.96875 | 6.72 |
| 44326.979166666664 | 6.71 |
| 44326.989583333336 | 6.71 |
| 44327.0 | 6.69 |
| 44327.010416666664 | 6.66 |
| 44327.020833333336 | 6.66 |
| 44327.03125 | 6.63 |
| 44327.041666666664 | 6.58 |
| 44327.052083333336 | 6.55 |
| 44327.0625 | 6.13 |
| 44327.072916666664 | 6.02 |
| 44327.083333333336 | 5.95 |
| 44327.09375 | 6.12 |
| 44327.104166666664 | 6.15 |
| 44327.114583333336 | 6.09 |
| 44327.125 | 6.05 |
| 44327.135416666664 | 5.93 |
| 44327.145833333336 | 5.8 |
| 44327.15625 | 5.61 |
| 44327.166666666664 | 5.57 |
| 44327.177083333336 | 5.79 |
| 44327.1875 | 5.89 |
| 44327.197916666664 | 5.98 |
| 44327.208333333336 | 6.05 |
| 44327.21875 | 6.09 |
| 44327.229166666664 | 6.13 |
| 44327.239583333336 | 6.02 |
| 44327.25 | 6.03 |
| 44327.260416666664 | 6.05 |
| 44327.270833333336 | 6 |
| 44327.28125 | 5.99 |
| 44327.291666666664 | 5.77 |
| 44327.302083333336 | 5.65 |
| 44327.3125 | 5.78 |
| 44327.322916666664 | 5.89 |
| 44327.333333333336 | 5.9 |
| 44327.34375 | 5.87 |
| 44327.354166666664 | 5.88 |
| 44327.364583333336 | 5.86 |
| 44327.375 | 5.87 |
| 44327.385416666664 | 5.87 |
| 44327.395833333336 | 5.85 |
| 44327.40625 | 5.83 |
| 44327.416666666664 | 5.81 |
| 44327.427083333336 | 5.79 |
| 44327.4375 | 5.78 |
| 44327.447916666664 | 5.77 |
| 44327.458333333336 | 5.76 |
| 44327.46875 | 5.75 |
| 44327.479166666664 | 5.74 |
| 44327.489583333336 | 5.72 |
| 44327.5 | 5.72 |
| 44327.510416666664 | 5.74 |
| 44327.520833333336 | 5.78 |
| 44327.53125 | 5.83 |
| 44327.541666666664 | 5.87 |
| 44327.552083333336 | 5.96 |
| 44327.5625 | 5.94 |
| 44327.572916666664 | 5.84 |
| 44327.583333333336 | 6.03 |
| 44327.59375 | 6.06 |
| 44327.604166666664 | 6.13 |
| 44327.614583333336 | 6.27 |
| 44327.625 | 6.33 |
| 44327.635416666664 | 6.32 |
| 44327.645833333336 | 6.42 |
| 44327.65625 | 6.53 |
| 44327.666666666664 | 6.73 |
| 44327.677083333336 | 6.81 |
| 44327.6875 | 6.91 |
| 44327.697916666664 | 7 |
| 44327.708333333336 | 7.14 |
| 44327.71875 | 7.21 |
| 44327.729166666664 | 7.28 |
| 44327.739583333336 | 7.27 |
| 44327.75 | 7.27 |
| 44327.760416666664 | 7.21 |
| 44327.770833333336 | 7.22 |
| 44327.78125 | 7.21 |
| 44327.791666666664 | 7.26 |
| 44327.802083333336 | 7.28 |
| 44327.8125 | 7.21 |
| 44327.822916666664 | 7.16 |
| 44327.833333333336 | 7.13 |
| 44327.84375 | 7.1 |
| 44327.854166666664 | 7.1 |
| 44327.864583333336 | 7.24 |
| 44327.875 | 7.41 |
| 44327.885416666664 | 7.52 |
| 44327.895833333336 | 7.54 |
| 44327.90625 | 7.47 |
| 44327.916666666664 | 7.39 |
| 44327.927083333336 | 7.37 |
| 44327.9375 | 7.34 |
| 44327.947916666664 | 7.32 |
| 44327.958333333336 | 7.35 |
| 44327.96875 | 7.34 |
| 44327.979166666664 | 7.34 |
| 44327.989583333336 | 7.29 |
| 44328.0 | 7.22 |
| 44328.010416666664 | 7.13 |
| 44328.020833333336 | 7.03 |
| 44328.03125 | 6.95 |
| 44328.041666666664 | 6.9 |
| 44328.052083333336 | 6.85 |
| 44328.0625 | 6.8 |
| 44328.072916666664 | 6.77 |
| 44328.083333333336 | 6.69 |
| 44328.09375 | 6.75 |
| 44328.104166666664 | 6.78 |
| 44328.114583333336 | 6.72 |
| 44328.125 | 6.69 |
| 44328.135416666664 | 6.64 |
| 44328.145833333336 | 6.64 |
| 44328.15625 | 6.46 |
| 44328.166666666664 | 6.39 |
| 44328.177083333336 | 6.18 |
| 44328.1875 | 6.15 |
| 44328.197916666664 | 6.15 |
| 44328.208333333336 | 6.15 |
| 44328.21875 | 6.25 |
| 44328.229166666664 | 6.29 |
| 44328.239583333336 | 6.28 |
| 44328.25 | 6.25 |
| 44328.260416666664 | 6.21 |
| 44328.270833333336 | 6.2 |
| 44328.28125 | 6.22 |
| 44328.291666666664 | 6.19 |
| 44328.302083333336 | 6.11 |
| 44328.3125 | 6.02 |
| 44328.322916666664 | 5.96 |
| 44328.333333333336 | 5.98 |
| 44328.34375 | 6.05 |
| 44328.354166666664 | 6.02 |
| 44328.364583333336 | 5.99 |
| 44328.375 | 5.97 |
| 44328.385416666664 | 5.98 |
| 44328.395833333336 | 6.01 |
| 44328.40625 | 6.05 |
| 44328.416666666664 | 6.01 |
| 44328.427083333336 | 6.02 |
| 44328.4375 | 6.03 |
| 44328.447916666664 | 6.02 |
| 44328.458333333336 | 6.01 |
| 44328.46875 | 5.99 |
| 44328.479166666664 | 5.98 |
| 44328.489583333336 | 6.02 |
| 44328.5 | 6.05 |
| 44328.510416666664 | 6.06 |
| 44328.520833333336 | 6.08 |
| 44328.53125 | 6.09 |
| 44328.541666666664 | 6.13 |
| 44328.552083333336 | 6.15 |
| 44328.5625 | 6.18 |
| 44328.572916666664 | 6.21 |
| 44328.583333333336 | 6.21 |
| 44328.59375 | 6.14 |
| 44328.604166666664 | 6.13 |
| 44328.614583333336 | 6.2 |
| 44328.625 | 6.28 |
| 44328.635416666664 | 6.32 |
| 44328.645833333336 | 6.37 |
| 44328.65625 | 6.44 |
| 44328.666666666664 | 6.42 |
| 44328.677083333336 | 6.46 |
| 44328.6875 | 6.42 |
| 44328.697916666664 | 6.56 |
| 44328.708333333336 | 6.59 |
| 44328.71875 | 6.65 |
| 44328.729166666664 | 6.67 |
| 44328.739583333336 | 6.72 |
| 44328.75 | 6.72 |
| 44328.760416666664 | 6.77 |
| 44328.770833333336 | 6.72 |
| 44328.78125 | 6.72 |
| 44328.791666666664 | 6.72 |
| 44328.802083333336 | 6.76 |
| 44328.8125 | 6.79 |
| 44328.822916666664 | 6.79 |
| 44328.833333333336 | 6.77 |
| 44328.84375 | 6.79 |
| 44328.854166666664 | 6.76 |
| 44328.864583333336 | 6.69 |
| 44328.875 | 6.68 |
| 44328.885416666664 | 6.67 |
| 44328.895833333336 | 6.78 |
| 44328.90625 | 6.83 |
| 44328.916666666664 | 6.88 |
| 44328.927083333336 | 6.96 |
| 44328.9375 | 7.02 |
| 44328.947916666664 | 7.01 |
| 44328.958333333336 | 6.98 |
| 44328.96875 | 6.97 |
| 44328.979166666664 | 6.98 |
| 44328.989583333336 | 6.96 |
| 44329.0 | 6.85 |
| 44329.010416666664 | 6.78 |
| 44329.020833333336 | 6.74 |
| 44329.03125 | 6.71 |
| 44329.041666666664 | 6.69 |
| 44329.052083333336 | 6.67 |
| 44329.0625 | 6.66 |
| 44329.072916666664 | 6.65 |
| 44329.083333333336 | 6.65 |
| 44329.09375 | 6.63 |
| 44329.104166666664 | 6.53 |
| 44329.114583333336 | 6.52 |
| 44329.125 | 6.53 |
| 44329.135416666664 | 6.52 |
| 44329.145833333336 | 6.49 |
| 44329.15625 | 6.38 |
| 44329.166666666664 | 6.34 |
| 44329.177083333336 | 6.36 |
| 44329.1875 | 6.43 |
| 44329.197916666664 | 6.22 |
| 44329.208333333336 | 6.05 |
| 44329.21875 | 6.11 |
| 44329.229166666664 | 6.19 |
| 44329.239583333336 | 6.21 |
| 44329.25 | 6.3 |
| 44329.260416666664 | 6.29 |
| 44329.270833333336 | 6.32 |
| 44329.28125 | 6.31 |
| 44329.291666666664 | 6.31 |
| 44329.302083333336 | 6.24 |
| 44329.3125 | 6.23 |
| 44329.322916666664 | 6.23 |
| 44329.333333333336 | 6.2 |
| 44329.34375 | 6.1 |
| 44329.354166666664 | 6.12 |
| 44329.364583333336 | 6.17 |
| 44329.375 | 6.15 |
| 44329.385416666664 | 6.08 |
| 44329.395833333336 | 6.11 |
| 44329.40625 | 6.11 |
| 44329.416666666664 | 6.1 |
| 44329.427083333336 | 6.11 |
| 44329.4375 | 6.11 |
| 44329.447916666664 | 6.11 |
| 44329.458333333336 | 6.11 |
| 44329.46875 | 6.09 |
| 44329.479166666664 | 6.09 |
| 44329.489583333336 | 6.08 |
| 44329.5 | 6.08 |
| 44329.510416666664 | 6.08 |
| 44329.520833333336 | 6.09 |
| 44329.53125 | 6.12 |
| 44329.541666666664 | 6.14 |
| 44329.552083333336 | 6.16 |
| 44329.5625 | 6.19 |
| 44329.572916666664 | 6.24 |
| 44329.583333333336 | 6.29 |
| 44329.59375 | 6.35 |
| 44329.604166666664 | 6.48 |
| 44329.614583333336 | 6.47 |
| 44329.625 | 6.5 |
| 44329.635416666664 | 6.81 |
| 44329.645833333336 | 6.78 |
| 44329.65625 | 6.86 |
| 44329.666666666664 | 6.89 |
| 44329.677083333336 | 6.88 |
| 44329.6875 | 7.08 |
| 44329.697916666664 | 7.27 |
| 44329.708333333336 | 7.27 |
| 44329.71875 | 7.48 |
| 44329.729166666664 | 7.69 |
| 44329.739583333336 | 7.78 |
| 44329.75 | 7.89 |
| 44329.760416666664 | 7.94 |
| 44329.770833333336 | 7.97 |
| 44329.78125 | 7.99 |
| 44329.791666666664 | 7.94 |
| 44329.802083333336 | 7.96 |
| 44329.8125 | 7.9 |
| 44329.822916666664 | 7.84 |
| 44329.833333333336 | 7.81 |
| 44329.84375 | 7.8 |
| 44329.854166666664 | 7.85 |
| 44329.864583333336 | 7.75 |
| 44329.875 | 7.7 |
| 44329.885416666664 | 7.69 |
| 44329.895833333336 | 7.67 |
| 44329.90625 | 7.71 |
| 44329.916666666664 | 7.75 |
| 44329.927083333336 | 7.84 |
| 44329.9375 | 7.94 |
| 44329.947916666664 | 7.99 |
| 44329.958333333336 | 8 |
| 44329.96875 | 8 |
| 44329.979166666664 | 7.96 |
| 44329.989583333336 | 7.82 |
| 44330.0 | 7.7 |
| 44330.010416666664 | 7.59 |
| 44330.020833333336 | 7.41 |
| 44330.03125 | 7.3 |
| 44330.041666666664 | 7.3 |
| 44330.052083333336 | 7.3 |
| 44330.0625 | 7.29 |
| 44330.072916666664 | 7.25 |
| 44330.083333333336 | 7.22 |
| 44330.09375 | 7.2 |
| 44330.104166666664 | 7.15 |
| 44330.114583333336 | 7.1 |
| 44330.125 | 6.98 |
| 44330.135416666664 | 6.95 |
| 44330.145833333336 | 6.97 |
| 44330.15625 | 6.93 |
| 44330.166666666664 | 6.91 |
| 44330.177083333336 | 6.82 |
| 44330.1875 | 6.75 |
| 44330.197916666664 | 6.56 |
| 44330.208333333336 | 6.58 |
| 44330.21875 | 6.47 |
| 44330.229166666664 | 6.43 |
| 44330.239583333336 | 6.32 |
| 44330.25 | 6.33 |
| 44330.260416666664 | 6.58 |
| 44330.270833333336 | 6.61 |
| 44330.28125 | 6.59 |
| 44330.291666666664 | 6.67 |
| 44330.302083333336 | 6.63 |
| 44330.3125 | 6.62 |
| 44330.322916666664 | 6.7 |
| 44330.333333333336 | 6.71 |
| 44330.34375 | 6.57 |
| 44330.354166666664 | 6.66 |
| 44330.364583333336 | 6.47 |
| 44330.375 | 6.47 |
| 44330.385416666664 | 6.43 |
| 44330.395833333336 | 6.56 |
| 44330.40625 | 6.52 |
| 44330.416666666664 | 6.49 |
| 44330.427083333336 | 6.46 |
| 44330.4375 | 6.45 |
| 44330.447916666664 | 6.41 |
| 44330.458333333336 | 6.42 |
| 44330.46875 | 6.39 |
| 44330.479166666664 | 6.34 |
| 44330.489583333336 | 6.29 |
| 44330.5 | 6.25 |
| 44330.510416666664 | 6.22 |
| 44330.520833333336 | 6.19 |
| 44330.53125 | 6.17 |
| 44330.541666666664 | 6.16 |
| 44330.552083333336 | 6.15 |
| 44330.5625 | 6.16 |
| 44330.572916666664 | 6.16 |
| 44330.583333333336 | 6.15 |
| 44330.59375 | 6.14 |
| 44330.604166666664 | 6.11 |
| 44330.614583333336 | 6.09 |
| 44330.625 | 6.09 |
| 44330.635416666664 | 6.3 |
| 44330.645833333336 | 6.31 |
| 44330.65625 | 6.38 |
| 44330.666666666664 | 6.68 |
| 44330.677083333336 | 6.7 |
| 44330.6875 | 6.91 |
| 44330.697916666664 | 6.93 |
| 44330.708333333336 | 6.56 |
| 44330.71875 | 6.82 |
| 44330.729166666664 | 6.86 |
| 44330.739583333336 | 7.1 |
| 44330.75 | 7.27 |
| 44330.760416666664 | 7.5 |
| 44330.770833333336 | 7.56 |
| 44330.78125 | 7.67 |
| 44330.791666666664 | 7.71 |
| 44330.802083333336 | 7.72 |
| 44330.8125 | 7.72 |
| 44330.822916666664 | 7.71 |
| 44330.833333333336 | 7.7 |
| 44330.84375 | 7.61 |
| 44330.854166666664 | 7.54 |
| 44330.864583333336 | 7.51 |
| 44330.875 | 7.39 |
| 44330.885416666664 | 7.5 |
| 44330.895833333336 | 7.57 |
| 44330.90625 | 7.58 |
| 44330.916666666664 | 7.53 |
| 44330.927083333336 | 7.49 |
| 44330.9375 | 7.47 |
| 44330.947916666664 | 7.51 |
| 44330.958333333336 | 7.58 |
| 44330.96875 | 7.61 |
| 44330.979166666664 | 7.61 |
| 44330.989583333336 | 7.56 |
| 44331.0 | 7.46 |
| 44331.010416666664 | 7.34 |
| 44331.020833333336 | 7.23 |
| 44331.03125 | 7.2 |
| 44331.041666666664 | 7.2 |
| 44331.052083333336 | 7.15 |
| 44331.0625 | 7.08 |
| 44331.072916666664 | 7.03 |
| 44331.083333333336 | 6.98 |
| 44331.09375 | 6.95 |
| 44331.104166666664 | 6.92 |
| 44331.114583333336 | 6.86 |
| 44331.125 | 6.83 |
| 44331.135416666664 | 6.77 |
| 44331.145833333336 | 6.66 |
| 44331.15625 | 6.18 |
| 44331.166666666664 | 6.62 |
| 44331.177083333336 | 6.54 |
| 44331.1875 | 6.6 |
| 44331.197916666664 | 6.58 |
| 44331.208333333336 | 6.46 |
| 44331.21875 | 6.39 |
| 44331.229166666664 | 6.28 |
| 44331.239583333336 | 6.31 |
| 44331.25 | 6.14 |
| 44331.260416666664 | 6.12 |
| 44331.270833333336 | 6.27 |
| 44331.28125 | 6.3 |
| 44331.291666666664 | 6.38 |
| 44331.302083333336 | 6.37 |
| 44331.3125 | 6.41 |
| 44331.322916666664 | 6.46 |
| 44331.333333333336 | 6.39 |
| 44331.34375 | 6.35 |
| 44331.354166666664 | 6.29 |
| 44331.364583333336 | 6.32 |
| 44331.375 | 6.24 |
| 44331.385416666664 | 6.23 |
| 44331.395833333336 | 6.08 |
| 44331.40625 | 5.86 |
| 44331.416666666664 | 6.11 |
| 44331.427083333336 | 6.2 |
| 44331.4375 | 6.18 |
| 44331.447916666664 | 6.14 |
| 44331.458333333336 | 6.12 |
| 44331.46875 | 6.1 |
| 44331.479166666664 | 6.12 |
| 44331.489583333336 | 6.13 |
| 44331.5 | 6.11 |
| 44331.510416666664 | 6.07 |
| 44331.520833333336 | 6.05 |
| 44331.53125 | 6.02 |
| 44331.541666666664 | 5.99 |
| 44331.552083333336 | 5.98 |
| 44331.5625 | 5.96 |
| 44331.572916666664 | 5.93 |
| 44331.583333333336 | 5.9 |
| 44331.59375 | 5.88 |
| 44331.604166666664 | 5.86 |
| 44331.614583333336 | 5.88 |
| 44331.625 | 5.9 |
| 44331.635416666664 | 5.9 |
| 44331.645833333336 | 5.92 |
| 44331.65625 | 5.83 |
| 44331.666666666664 | 6.17 |
| 44331.677083333336 | 6.2 |
| 44331.6875 | 6.44 |
| 44331.697916666664 | 6.62 |
| 44331.708333333336 | 6.78 |
| 44331.71875 | 6.96 |
| 44331.729166666664 | 7.2 |
| 44331.739583333336 | 7.3 |
| 44331.75 | 7.12 |
| 44331.760416666664 | 7.16 |
| 44331.770833333336 | 7.21 |
| 44331.78125 | 7.34 |
| 44331.791666666664 | 7.56 |
| 44331.802083333336 | 7.74 |
| 44331.8125 | 7.82 |
| 44331.822916666664 | 7.88 |
| 44331.833333333336 | 7.92 |
| 44331.84375 | 7.91 |
| 44331.854166666664 | 7.91 |
| 44331.864583333336 | 7.86 |
| 44331.875 | 7.85 |
| 44331.885416666664 | 7.69 |
| 44331.895833333336 | 7.55 |
| 44331.90625 | 7.75 |
| 44331.916666666664 | 7.66 |
| 44331.927083333336 | 7.66 |
| 44331.9375 | 7.59 |
| 44331.947916666664 | 7.54 |
| 44331.958333333336 | 7.47 |
| 44331.96875 | 7.48 |
| 44331.979166666664 | 7.42 |
| 44331.989583333336 | 7.41 |
| 44332.0 | 7.35 |
| 44332.010416666664 | 7.28 |
| 44332.020833333336 | 7.19 |
| 44332.03125 | 7.05 |
| 44332.041666666664 | 6.96 |
| 44332.052083333336 | 6.89 |
| 44332.0625 | 6.82 |
| 44332.072916666664 | 6.84 |
| 44332.083333333336 | 6.82 |
| 44332.09375 | 6.78 |
| 44332.104166666664 | 6.73 |
| 44332.114583333336 | 6.69 |
| 44332.125 | 6.61 |
| 44332.135416666664 | 6.6 |
| 44332.145833333336 | 6.6 |
| 44332.15625 | 6.54 |
| 44332.166666666664 | 6.46 |
| 44332.177083333336 | 6.17 |
| 44332.1875 | 5.92 |
| 44332.197916666664 | 6.06 |
| 44332.208333333336 | 6.32 |
| 44332.21875 | 6.31 |
| 44332.229166666664 | 6.36 |
| 44332.239583333336 | 6.17 |
| 44332.25 | 6.09 |
| 44332.260416666664 | 5.96 |
| 44332.270833333336 | 6.02 |
| 44332.28125 | 5.86 |
| 44332.291666666664 | 5.87 |
| 44332.302083333336 | 6.11 |
| 44332.3125 | 6.1 |
| 44332.322916666664 | 6.18 |
| 44332.333333333336 | 6.16 |
| 44332.34375 | 6.16 |
| 44332.354166666664 | 6.17 |
| 44332.364583333336 | 6.16 |
| 44332.375 | 6.14 |
| 44332.385416666664 | 6.12 |
| 44332.395833333336 | 6.09 |
| 44332.40625 | 6 |
| 44332.416666666664 | 5.96 |
| 44332.427083333336 | 5.86 |
| 44332.4375 | 5.28 |
| 44332.447916666664 | 5.35 |
| 44332.458333333336 | 5.83 |
| 44332.46875 | 5.87 |
| 44332.479166666664 | 5.83 |
| 44332.489583333336 | 5.8 |
| 44332.5 | 5.78 |
| 44332.510416666664 | 5.8 |
| 44332.520833333336 | 5.79 |
| 44332.53125 | 5.78 |
| 44332.541666666664 | 5.76 |
| 44332.552083333336 | 5.76 |
| 44332.5625 | 5.75 |
| 44332.572916666664 | 5.76 |
| 44332.583333333336 | 5.78 |
| 44332.59375 | 5.78 |
| 44332.604166666664 | 5.76 |
| 44332.614583333336 | 5.77 |
| 44332.625 | 5.77 |
| 44332.635416666664 | 5.78 |
| 44332.645833333336 | 5.78 |
| 44332.65625 | 5.75 |
| 44332.666666666664 | 5.68 |
| 44332.677083333336 | 5.72 |
| 44332.6875 | 6.05 |
| 44332.697916666664 | 6.08 |
| 44332.708333333336 | 6.1 |
| 44332.71875 | 6.27 |
| 44332.729166666664 | 6.53 |
| 44332.739583333336 | 6.55 |
| 44332.75 | 6.68 |
| 44332.760416666664 | 6.6 |
| 44332.770833333336 | 6.57 |
| 44332.78125 | 6.65 |
| 44332.791666666664 | 6.86 |
| 44332.802083333336 | 7.15 |
| 44332.8125 | 7.28 |
| 44332.822916666664 | 7.4 |
| 44332.833333333336 | 7.5 |
| 44332.84375 | 7.51 |
| 44332.854166666664 | 7.46 |
| 44332.864583333336 | 7.59 |
| 44332.875 | 7.54 |
| 44332.885416666664 | 7.48 |
| 44332.895833333336 | 7.41 |
| 44332.90625 | 7.4 |
| 44332.916666666664 | 7.31 |
| 44332.927083333336 | 7.19 |
| 44332.9375 | 7.24 |
| 44332.947916666664 | 7.15 |
| 44332.958333333336 | 7.16 |
| 44332.96875 | 7.1 |
| 44332.979166666664 | 7.1 |
| 44332.989583333336 | 7.06 |
| 44333.0 | 7.02 |
| 44333.010416666664 | 7 |
| 44333.020833333336 | 6.9 |
| 44333.03125 | 6.79 |
| 44333.041666666664 | 6.65 |
| 44333.052083333336 | 6.54 |
| 44333.0625 | 6.46 |
| 44333.072916666664 | 6.4 |
| 44333.083333333336 | 6.35 |
| 44333.09375 | 6.29 |
| 44333.104166666664 | 6.23 |
| 44333.114583333336 | 6.2 |
| 44333.125 | 6.17 |
| 44333.135416666664 | 6.18 |
| 44333.145833333336 | 6.18 |
| 44333.15625 | 6.19 |
| 44333.166666666664 | 6.13 |
| 44333.177083333336 | 6.1 |
| 44333.1875 | 6.04 |
| 44333.197916666664 | 5.53 |
| 44333.208333333336 | 4.3 |
| 44333.21875 | 5.07 |
| 44333.229166666664 | 5.17 |
| 44333.239583333336 | 5.64 |
| 44333.25 | 6.06 |
| 44333.260416666664 | 6 |
| 44333.270833333336 | 5.66 |
| 44333.28125 | 5.62 |
| 44333.291666666664 | 5.67 |
| 44333.302083333336 | 5.45 |
| 44333.3125 | 5.46 |
| 44333.322916666664 | 5.47 |
| 44333.333333333336 | 5.45 |
| 44333.34375 | 5.63 |
| 44333.354166666664 | 5.72 |
| 44333.364583333336 | 5.77 |
| 44333.375 | 5.71 |
| 44333.385416666664 | 5.71 |
| 44333.395833333336 | 5.7 |
| 44333.40625 | 5.67 |
| 44333.416666666664 | 5.68 |
| 44333.427083333336 | 5.63 |
| 44333.4375 | 5.65 |
| 44333.447916666664 | 5.58 |
| 44333.458333333336 | 5.63 |
| 44333.46875 | 5.59 |
| 44333.479166666664 | 5.65 |
| 44333.489583333336 | 5.63 |
| 44333.5 | 5.54 |
| 44333.510416666664 | 5.56 |
| 44333.520833333336 | 5.49 |
| 44333.53125 | 5.51 |
| 44333.541666666664 | 5.49 |
| 44333.552083333336 | 5.52 |
| 44333.5625 | 5.53 |
| 44333.572916666664 | 5.57 |
| 44333.583333333336 | 5.65 |
| 44333.59375 | 5.72 |
| 44333.604166666664 | 5.79 |
| 44333.614583333336 | 5.82 |
| 44333.625 | 5.88 |
| 44333.635416666664 | 5.89 |
| 44333.645833333336 | 5.94 |
| 44333.65625 | 5.99 |
| 44333.666666666664 | 5.99 |
| 44333.677083333336 | 6 |
| 44333.6875 | 6.04 |
| 44333.697916666664 | 5.99 |
| 44333.708333333336 | 6.08 |
| 44333.71875 | 5.93 |
| 44333.729166666664 | 6.25 |
| 44333.739583333336 | 6.47 |
| 44333.75 | 6.48 |
| 44333.760416666664 | 6.68 |
| 44333.770833333336 | 6.85 |
| 44333.78125 | 6.65 |
| 44333.791666666664 | 6.63 |
| 44333.802083333336 | 6.55 |
| 44333.8125 | 6.76 |
| 44333.822916666664 | 6.96 |
| 44333.833333333336 | 7.15 |
| 44333.84375 | 7.21 |
| 44333.854166666664 | 7.27 |
| 44333.864583333336 | 7.43 |
| 44333.875 | 7.49 |
| 44333.885416666664 | 7.49 |
| 44333.895833333336 | 7.46 |
| 44333.90625 | 7.39 |
| 44333.916666666664 | 7.36 |
| 44333.927083333336 | 7.3 |
| 44333.9375 | 7.26 |
| 44333.947916666664 | 7.08 |
| 44333.958333333336 | 6.78 |
| 44333.96875 | 5.47 |
| 44333.979166666664 | 6.44 |
| 44333.989583333336 | 6.81 |
| 44334.0 | 6.85 |
| 44334.010416666664 | 6.79 |
| 44334.020833333336 | 6.86 |
| 44334.03125 | 6.9 |
| 44334.041666666664 | 6.9 |
| 44334.052083333336 | 6.84 |
| 44334.0625 | 6.79 |
| 44334.072916666664 | 6.7 |
| 44334.083333333336 | 6.57 |
| 44334.09375 | 6.46 |
| 44334.104166666664 | 6.38 |
| 44334.114583333336 | 6.29 |
| 44334.125 | 6.19 |
| 44334.135416666664 | 6.09 |
| 44334.145833333336 | 6.1 |
| 44334.15625 | 6.05 |
| 44334.166666666664 | 6.01 |
| 44334.177083333336 | 6.01 |
| 44334.1875 | 6 |
| 44334.197916666664 | 6.01 |
| 44334.208333333336 | 6.01 |
| 44334.21875 | 5.93 |
| 44334.229166666664 | 5.08 |
| 44334.239583333336 | 4.63 |
| 44334.25 | 4.78 |
| 44334.260416666664 | 5.09 |
| 44334.270833333336 | 5.11 |
| 44334.28125 | 5.84 |
| 44334.291666666664 | 5.81 |
| 44334.302083333336 | 5.88 |
| 44334.3125 | 5.47 |
| 44334.322916666664 | 5.46 |
| 44334.333333333336 | 5.53 |
| 44334.34375 | 5.36 |
| 44334.354166666664 | 5.57 |
| 44334.364583333336 | 5.46 |
| 44334.375 | 5.55 |
| 44334.385416666664 | 5.61 |
| 44334.395833333336 | 5.64 |
| 44334.40625 | 5.63 |
| 44334.416666666664 | 5.6 |
| 44334.427083333336 | 5.57 |
| 44334.4375 | 5.57 |
| 44334.447916666664 | 5.58 |
| 44334.458333333336 | 5.56 |
| 44334.46875 | 5.53 |
| 44334.479166666664 | 5.51 |
| 44334.489583333336 | 5.49 |
| 44334.5 | 5.28 |
| 44334.510416666664 | 4.51 |
| 44334.520833333336 | 4.74 |
| 44334.53125 | 5.02 |
| 44334.541666666664 | 5.31 |
| 44334.552083333336 | 5.5 |
| 44334.5625 | 5.48 |
| 44334.572916666664 | 5.49 |
| 44334.583333333336 | 5.5 |
| 44334.59375 | 5.53 |
| 44334.604166666664 | 5.57 |
| 44334.614583333336 | 5.65 |
| 44334.625 | 5.74 |
| 44334.635416666664 | 5.85 |
| 44334.645833333336 | 5.94 |
| 44334.65625 | 6 |
| 44334.666666666664 | 6.03 |
| 44334.677083333336 | 6.03 |
| 44334.6875 | 6.03 |
| 44334.697916666664 | 6.08 |
| 44334.708333333336 | 6.11 |
| 44334.71875 | 6.15 |
| 44334.729166666664 | 6.17 |
| 44334.739583333336 | 6.22 |
| 44334.75 | 6.37 |
| 44334.760416666664 | 6.42 |
| 44334.770833333336 | 6.5 |
| 44334.78125 | 6.72 |
| 44334.791666666664 | 6.81 |
| 44334.802083333336 | 6.88 |
| 44334.8125 | 6.93 |
| 44334.822916666664 | 6.99 |
| 44334.833333333336 | 6.9 |
| 44334.84375 | 6.98 |
| 44334.854166666664 | 7.02 |
| 44334.864583333336 | 7.19 |
| 44334.875 | 7.24 |
| 44334.885416666664 | 7.3 |
| 44334.895833333336 | 7.31 |
| 44334.90625 | 7.34 |
| 44334.916666666664 | 7.38 |
| 44334.927083333336 | 7.41 |
| 44334.9375 | 7.41 |
| 44334.947916666664 | 7.35 |
| 44334.958333333336 | 7.3 |
| 44334.96875 | 7.25 |
| 44334.979166666664 | 7.2 |
| 44334.989583333336 | 7.2 |
| 44335.0 | 7.19 |
| 44335.010416666664 | 7.08 |
| 44335.020833333336 | 7.01 |
| 44335.03125 | 6.93 |
| 44335.041666666664 | 6.88 |
| 44335.052083333336 | 6.79 |
| 44335.0625 | 6.74 |
| 44335.072916666664 | 6.69 |
| 44335.083333333336 | 6.64 |
| 44335.09375 | 6.57 |
| 44335.104166666664 | 6.46 |
| 44335.114583333336 | 6.33 |
| 44335.125 | 6.22 |
| 44335.135416666664 | 6.15 |
| 44335.145833333336 | 6.09 |
| 44335.15625 | 6.04 |
| 44335.166666666664 | 6 |
| 44335.177083333336 | 5.95 |
| 44335.1875 | 5.92 |
| 44335.197916666664 | 5.92 |
| 44335.208333333336 | 5.92 |
| 44335.21875 | 5.94 |
| 44335.229166666664 | 5.94 |
| 44335.239583333336 | 5.95 |
| 44335.25 | 5.94 |
| 44335.260416666664 | 6.02 |
| 44335.270833333336 | 5.77 |
| 44335.28125 | 5.81 |
| 44335.291666666664 | 5.73 |
| 44335.302083333336 | 5.79 |
| 44335.3125 | 5.86 |
| 44335.322916666664 | 6 |
| 44335.333333333336 | 5.75 |
| 44335.34375 | 5.6 |
| 44335.354166666664 | 5.71 |
| 44335.364583333336 | 5.6 |
| 44335.375 | 5.46 |
| 44335.385416666664 | 5.47 |
| 44335.395833333336 | 5.49 |
| 44335.40625 | 5.46 |
| 44335.416666666664 | 5.47 |
| 44335.427083333336 | 5.41 |
| 44335.4375 | 5.36 |
| 44335.447916666664 | 5.33 |
| 44335.458333333336 | 5.31 |
| 44335.46875 | 5.34 |
| 44335.479166666664 | 5.35 |
| 44335.489583333336 | 5.38 |
| 44335.5 | 5.37 |
| 44335.510416666664 | 5.35 |
| 44335.520833333336 | 5.37 |
| 44335.53125 | 5.4 |
| 44335.541666666664 | 5.37 |
| 44335.552083333336 | 5.37 |
| 44335.5625 | 5.34 |
| 44335.572916666664 | 5.31 |
| 44335.583333333336 | 5.23 |
| 44335.59375 | 5.19 |
| 44335.604166666664 | 5.22 |
| 44335.614583333336 | 5.3 |
| 44335.625 | 5.36 |
| 44335.635416666664 | 5.46 |
| 44335.645833333336 | 5.62 |
| 44335.65625 | 5.77 |
| 44335.666666666664 | 5.89 |
| 44335.677083333336 | 6.05 |
| 44335.6875 | 6.11 |
| 44335.697916666664 | 6.26 |
| 44335.708333333336 | 6.37 |
| 44335.71875 | 6.4 |
| 44335.729166666664 | 6.45 |
| 44335.739583333336 | 6.43 |
| 44335.75 | 6.4 |
| 44335.760416666664 | 6.37 |
| 44335.770833333336 | 6.31 |
| 44335.78125 | 6.26 |
| 44335.791666666664 | 6.19 |
| 44335.802083333336 | 6.45 |
| 44335.8125 | 6.41 |
| 44335.822916666664 | 6.46 |
| 44335.833333333336 | 6.48 |
| 44335.84375 | 6.65 |
| 44335.854166666664 | 6.71 |
| 44335.864583333336 | 6.84 |
| 44335.875 | 6.82 |
| 44335.885416666664 | 6.73 |
| 44335.895833333336 | 6.71 |
| 44335.90625 | 6.84 |
| 44335.916666666664 | 6.9 |
| 44335.927083333336 | 6.89 |
| 44335.9375 | 6.89 |
| 44335.947916666664 | 6.93 |
| 44335.958333333336 | 6.93 |
| 44335.96875 | 6.96 |
| 44335.979166666664 | 6.97 |
| 44335.989583333336 | 6.95 |
| 44336.0 | 6.96 |
| 44336.010416666664 | 6.93 |
| 44336.020833333336 | 6.86 |
| 44336.03125 | 6.87 |
| 44336.041666666664 | 6.86 |
| 44336.052083333336 | 6.82 |
| 44336.0625 | 6.61 |
| 44336.072916666664 | 6.59 |
| 44336.083333333336 | 6.49 |
| 44336.09375 | 6.38 |
| 44336.104166666664 | 6.33 |
| 44336.114583333336 | 6.28 |
| 44336.125 | 6.23 |
| 44336.135416666664 | 6.15 |
| 44336.145833333336 | 6.03 |
| 44336.15625 | 5.92 |
| 44336.166666666664 | 5.78 |
| 44336.177083333336 | 5.68 |
| 44336.1875 | 5.56 |
| 44336.197916666664 | 5.47 |
| 44336.208333333336 | 5.39 |
| 44336.21875 | 5.33 |
| 44336.229166666664 | 5.24 |
| 44336.239583333336 | 5.16 |
| 44336.25 | 5.14 |
| 44336.260416666664 | 5.2 |
| 44336.270833333336 | 5.27 |
| 44336.28125 | 5.32 |
| 44336.291666666664 | 5.36 |
| 44336.302083333336 | 5.47 |
| 44336.3125 | 5.53 |
| 44336.322916666664 | 5.19 |
| 44336.333333333336 | 5.38 |
| 44336.34375 | 5.49 |
| 44336.354166666664 | 5.38 |
| 44336.364583333336 | 5.45 |
| 44336.375 | 5.21 |
| 44336.385416666664 | 5.02 |
| 44336.395833333336 | 4.92 |
| 44336.40625 | 4.87 |
| 44336.416666666664 | 4.81 |
| 44336.427083333336 | 4.79 |
| 44336.4375 | 4.86 |
| 44336.447916666664 | 4.94 |
| 44336.458333333336 | 4.89 |
| 44336.46875 | 4.96 |
| 44336.479166666664 | 4.96 |
| 44336.489583333336 | 4.98 |
| 44336.5 | 4.99 |
| 44336.510416666664 | 4.99 |
| 44336.520833333336 | 5.01 |
| 44336.53125 | 5.03 |
| 44336.541666666664 | 5.06 |
| 44336.552083333336 | 5.11 |
| 44336.5625 | 5.14 |
| 44336.572916666664 | 5.22 |
| 44336.583333333336 | 5.3 |
| 44336.59375 | 5.2 |
| 44336.604166666664 | 5.15 |
| 44336.614583333336 | 5.08 |
| 44336.625 | 5.01 |
| 44336.635416666664 | 5.08 |
| 44336.645833333336 | 5.08 |
| 44336.65625 | 5.1 |
| 44336.666666666664 | 5.19 |
| 44336.677083333336 | 5.3 |
| 44336.6875 | 5.45 |
| 44336.697916666664 | 5.72 |
| 44336.708333333336 | 5.91 |
| 44336.71875 | 6.01 |
| 44336.729166666664 | 6.09 |
| 44336.739583333336 | 6.13 |
| 44336.75 | 6.19 |
| 44336.760416666664 | 6.22 |
| 44336.770833333336 | 6.23 |
| 44336.78125 | 6.2 |
| 44336.791666666664 | 6.14 |
| 44336.802083333336 | 6.11 |
| 44336.8125 | 6.09 |
| 44336.822916666664 | 6.23 |
| 44336.833333333336 | 6.3 |
| 44336.84375 | 6.42 |
| 44336.854166666664 | 6.48 |
| 44336.864583333336 | 6.63 |
| 44336.875 | 6.64 |
| 44336.885416666664 | 6.8 |
| 44336.895833333336 | 6.97 |
| 44336.90625 | 6.95 |
| 44336.916666666664 | 6.8 |
| 44336.927083333336 | 6.84 |
| 44336.9375 | 6.88 |
| 44336.947916666664 | 6.87 |
| 44336.958333333336 | 6.91 |
| 44336.96875 | 6.99 |
| 44336.979166666664 | 7.07 |
| 44336.989583333336 | 7.04 |
| 44337.0 | 6.98 |
| 44337.010416666664 | 6.92 |
| 44337.020833333336 | 6.89 |
| 44337.03125 | 6.82 |
| 44337.041666666664 | 6.8 |
| 44337.052083333336 | 6.77 |
| 44337.0625 | 6.77 |
| 44337.072916666664 | 6.75 |
| 44337.083333333336 | 6.74 |
| 44337.09375 | 6.71 |
| 44337.104166666664 | 6.71 |
| 44337.114583333336 | 6.54 |
| 44337.125 | 6.49 |
| 44337.135416666664 | 6.45 |
| 44337.145833333336 | 6.41 |
| 44337.15625 | 6.35 |
| 44337.166666666664 | 6.3 |
| 44337.177083333336 | 6.29 |
| 44337.1875 | 6.25 |
| 44337.197916666664 | 6.16 |
| 44337.208333333336 | 6.09 |
| 44337.21875 | 6.05 |
| 44337.229166666664 | 6.02 |
| 44337.239583333336 | 5.98 |
| 44337.25 | 5.96 |
| 44337.260416666664 | 5.9 |
| 44337.270833333336 | 5.86 |
| 44337.28125 | 5.83 |
| 44337.291666666664 | 5.8 |
| 44337.302083333336 | 5.8 |
| 44337.3125 | 5.78 |
| 44337.322916666664 | 5.77 |
| 44337.333333333336 | 5.81 |
| 44337.34375 | 5.8 |
| 44337.354166666664 | 5.87 |
| 44337.364583333336 | 5.69 |
| 44337.375 | 5.7 |
| 44337.385416666664 | 5.76 |
| 44337.395833333336 | 5.8 |
| 44337.40625 | 5.78 |
| 44337.416666666664 | 5.71 |
| 44337.427083333336 | 5.57 |
| 44337.4375 | 5.49 |
| 44337.447916666664 | 5.4 |
| 44337.458333333336 | 5.38 |
| 44337.46875 | 5.3 |
| 44337.479166666664 | 5.36 |
| 44337.489583333336 | 5.37 |
| 44337.5 | 5.37 |
| 44337.510416666664 | 5.34 |
| 44337.520833333336 | 5.36 |
| 44337.53125 | 5.36 |
| 44337.541666666664 | 5.39 |
| 44337.552083333336 | 5.43 |
| 44337.5625 | 5.52 |
| 44337.572916666664 | 5.58 |
| 44337.583333333336 | 5.64 |
| 44337.59375 | 5.7 |
| 44337.604166666664 | 5.72 |
| 44337.614583333336 | 5.83 |
| 44337.625 | 5.86 |
| 44337.635416666664 | 5.87 |
| 44337.645833333336 | 5.93 |
| 44337.65625 | 5.79 |
| 44337.666666666664 | 5.67 |
| 44337.677083333336 | 5.73 |
| 44337.6875 | 5.78 |
| 44337.697916666664 | 5.82 |
| 44337.708333333336 | 5.94 |
| 44337.71875 | 6.19 |
| 44337.729166666664 | 6.49 |
| 44337.739583333336 | 6.72 |
| 44337.75 | 6.78 |
| 44337.760416666664 | 6.9 |
| 44337.770833333336 | 6.99 |
| 44337.78125 | 6.98 |
| 44337.791666666664 | 6.99 |
| 44337.802083333336 | 6.94 |
| 44337.8125 | 6.87 |
| 44337.822916666664 | 6.75 |
| 44337.833333333336 | 6.67 |
| 44337.84375 | 6.63 |
| 44337.854166666664 | 6.61 |
| 44337.864583333336 | 6.62 |
| 44337.875 | 6.57 |
| 44337.885416666664 | 6.87 |
| 44337.895833333336 | 6.9 |
| 44337.90625 | 6.96 |
| 44337.916666666664 | 7.08 |
| 44337.927083333336 | 6.95 |
| 44337.9375 | 6.92 |
| 44337.947916666664 | 6.9 |
| 44337.958333333336 | 6.83 |
| 44337.96875 | 6.82 |
| 44337.979166666664 | 6.77 |
| 44337.989583333336 | 6.85 |
| 44338.0 | 6.9 |
| 44338.010416666664 | 6.88 |
| 44338.020833333336 | 7.03 |
| 44338.03125 | 7.13 |
| 44338.041666666664 | 7.11 |
| 44338.052083333336 | 6.91 |
| 44338.0625 | 6.98 |
| 44338.072916666664 | 6.92 |
| 44338.083333333336 | 6.82 |
| 44338.09375 | 6.88 |
| 44338.104166666664 | 6.83 |
| 44338.114583333336 | 6.86 |
| 44338.125 | 6.96 |
| 44338.135416666664 | 6.84 |
| 44338.145833333336 | 6.88 |
| 44338.15625 | 6.65 |
| 44338.166666666664 | 6.68 |
| 44338.177083333336 | 6.61 |
| 44338.1875 | 6.52 |
| 44338.197916666664 | 6.46 |
| 44338.208333333336 | 6.41 |
| 44338.21875 | 6.37 |
| 44338.229166666664 | 6.27 |
| 44338.239583333336 | 6.15 |
| 44338.25 | 6.05 |
| 44338.260416666664 | 5.96 |
| 44338.270833333336 | 5.88 |
| 44338.28125 | 5.77 |
| 44338.291666666664 | 5.7 |
| 44338.302083333336 | 5.63 |
| 44338.3125 | 5.58 |
| 44338.322916666664 | 5.52 |
| 44338.333333333336 | 5.46 |
| 44338.34375 | 5.42 |
| 44338.354166666664 | 5.41 |
| 44338.364583333336 | 5.4 |
| 44338.375 | 5.4 |
| 44338.385416666664 | 5.39 |
| 44338.395833333336 | 5.31 |
| 44338.40625 | 5.19 |
| 44338.416666666664 | 5.23 |
| 44338.427083333336 | 5.26 |
| 44338.4375 | 5.31 |
| 44338.447916666664 | 5.34 |
| 44338.458333333336 | 5.21 |
| 44338.46875 | 5.25 |
| 44338.479166666664 | 5.12 |
| 44338.489583333336 | 5.1 |
| 44338.5 | 5.08 |
| 44338.510416666664 | 5.05 |
| 44338.520833333336 | 5.14 |
| 44338.53125 | 5.21 |
| 44338.541666666664 | 5.28 |
| 44338.552083333336 | 5.39 |
| 44338.5625 | 5.48 |
| 44338.572916666664 | 5.53 |
| 44338.583333333336 | 5.66 |
| 44338.59375 | 5.71 |
| 44338.604166666664 | 5.81 |
| 44338.614583333336 | 5.84 |
| 44338.625 | 5.88 |
| 44338.635416666664 | 5.9 |
| 44338.645833333336 | 5.98 |
| 44338.65625 | 5.92 |
| 44338.666666666664 | 5.92 |
| 44338.677083333336 | 5.88 |
| 44338.6875 | 5.82 |
| 44338.697916666664 | 5.74 |
| 44338.708333333336 | 5.75 |
| 44338.71875 | 5.86 |
| 44338.729166666664 | 6 |
| 44338.739583333336 | 6.06 |
| 44338.75 | 6.2 |
| 44338.760416666664 | 6.41 |
| 44338.770833333336 | 6.6 |
| 44338.78125 | 6.87 |
| 44338.791666666664 | 6.99 |
| 44338.802083333336 | 6.94 |
| 44338.8125 | 6.72 |
| 44338.822916666664 | 6.54 |
| 44338.833333333336 | 6.43 |
| 44338.84375 | 6.42 |
| 44338.854166666664 | 6.38 |
| 44338.864583333336 | 6.34 |
| 44338.875 | 6.26 |
| 44338.885416666664 | 6.22 |
| 44338.895833333336 | 6.18 |
| 44338.90625 | 6.17 |
| 44338.916666666664 | 6.11 |
| 44338.927083333336 | 6.14 |
| 44338.9375 | 6.06 |
| 44338.947916666664 | 6.12 |
| 44338.958333333336 | 6.07 |
| 44338.96875 | 6.15 |
| 44338.979166666664 | 6.18 |
| 44338.989583333336 | 6.18 |
| 44339.0 | 6.1 |
| 44339.010416666664 | 6.04 |
| 44339.020833333336 | 5.93 |
| 44339.03125 | 5.86 |
| 44339.041666666664 | 5.84 |
| 44339.052083333336 | 5.63 |
| 44339.0625 | 5.86 |
| 44339.072916666664 | 5.99 |
| 44339.083333333336 | 5.94 |
| 44339.09375 | 6.08 |
| 44339.104166666664 | 6.06 |
| 44339.114583333336 | 6.1 |
| 44339.125 | 6.1 |
| 44339.135416666664 | 6.16 |
| 44339.145833333336 | 6.16 |
| 44339.15625 | 6.29 |
| 44339.166666666664 | 6.19 |
| 44339.177083333336 | 6.24 |
| 44339.1875 | 6.16 |
| 44339.197916666664 | 5.93 |
| 44339.208333333336 | 5.94 |
| 44339.21875 | 5.88 |
| 44339.229166666664 | 5.81 |
| 44339.239583333336 | 5.74 |
| 44339.25 | 5.69 |
| 44339.260416666664 | 5.61 |
| 44339.270833333336 | 5.49 |
| 44339.28125 | 5.4 |
| 44339.291666666664 | 5.33 |
| 44339.302083333336 | 5.24 |
| 44339.3125 | 5.18 |
| 44339.322916666664 | 5.11 |
| 44339.333333333336 | 5.05 |
| 44339.34375 | 5 |
| 44339.354166666664 | 4.97 |
| 44339.364583333336 | 4.95 |
| 44339.375 | 4.96 |
| 44339.385416666664 | 5.01 |
| 44339.395833333336 | 5.05 |
| 44339.40625 | 5.07 |
| 44339.416666666664 | 5.06 |
| 44339.427083333336 | 5.04 |
| 44339.4375 | 4.95 |
| 44339.447916666664 | 4.83 |
| 44339.458333333336 | 5.09 |
| 44339.46875 | 4.97 |
| 44339.479166666664 | 4.93 |
| 44339.489583333336 | 4.89 |
| 44339.5 | 4.71 |
| 44339.510416666664 | 4.73 |
| 44339.520833333336 | 4.71 |
| 44339.53125 | 4.64 |
| 44339.541666666664 | 4.64 |
| 44339.552083333336 | 4.63 |
| 44339.5625 | 4.7 |
| 44339.572916666664 | 4.81 |
| 44339.583333333336 | 4.9 |
| 44339.59375 | 4.99 |
| 44339.604166666664 | 5.07 |
| 44339.614583333336 | 5.22 |
| 44339.625 | 5.24 |
| 44339.635416666664 | 5.32 |
| 44339.645833333336 | 5.39 |
| 44339.65625 | 5.46 |
| 44339.666666666664 | 5.56 |
| 44339.677083333336 | 5.6 |
| 44339.6875 | 5.65 |
| 44339.697916666664 | 5.57 |
| 44339.708333333336 | 5.61 |
| 44339.71875 | 5.56 |
| 44339.729166666664 | 5.5 |
| 44339.739583333336 | 5.49 |
| 44339.75 | 5.54 |
| 44339.760416666664 | 5.61 |
| 44339.770833333336 | 5.6 |
| 44339.78125 | 5.78 |
| 44339.791666666664 | 6.23 |
| 44339.802083333336 | 6.52 |
| 44339.8125 | 6.71 |
| 44339.822916666664 | 6.7 |
| 44339.833333333336 | 6.62 |
| 44339.84375 | 6.51 |
| 44339.854166666664 | 6.39 |
| 44339.864583333336 | 6.27 |
| 44339.875 | 6.19 |
| 44339.885416666664 | 6.14 |
| 44339.895833333336 | 6.1 |
| 44339.90625 | 6.08 |
| 44339.916666666664 | 6.07 |
| 44339.927083333336 | 6.06 |
| 44339.9375 | 6.01 |
| 44339.947916666664 | 5.99 |
| 44339.958333333336 | 5.97 |
| 44339.96875 | 5.92 |
| 44339.979166666664 | 5.92 |
| 44339.989583333336 | 5.94 |
| 44340.0 | 5.82 |
| 44340.010416666664 | 5.96 |
| 44340.020833333336 | 6 |
| 44340.03125 | 5.91 |
| 44340.041666666664 | 5.85 |
| 44340.052083333336 | 5.76 |
| 44340.0625 | 5.44 |
| 44340.072916666664 | 5.2 |
| 44340.083333333336 | 4.96 |
| 44340.09375 | 5.02 |
| 44340.104166666664 | 4.8 |
| 44340.114583333336 | 4.93 |
| 44340.125 | 5.18 |
| 44340.135416666664 | 5.05 |
| 44340.145833333336 | 5.13 |
| 44340.15625 | 5.46 |
| 44340.166666666664 | 5.48 |
| 44340.177083333336 | 5.42 |
| 44340.1875 | 5.42 |
| 44340.197916666664 | 5.48 |
| 44340.208333333336 | 5.4 |
| 44340.21875 | 5.33 |
| 44340.229166666664 | 5.34 |
| 44340.239583333336 | 5.14 |
| 44340.25 | 5.1 |
| 44340.260416666664 | 5.11 |
| 44340.270833333336 | 5.09 |
| 44340.28125 | 5.06 |
| 44340.291666666664 | 5.05 |
| 44340.302083333336 | 5.01 |
| 44340.3125 | 4.97 |
| 44340.322916666664 | 4.87 |
| 44340.333333333336 | 4.84 |
| 44340.34375 | 4.83 |
| 44340.354166666664 | 4.8 |
| 44340.364583333336 | 4.85 |
| 44340.375 | 4.89 |
| 44340.385416666664 | 4.97 |
| 44340.395833333336 | 5.05 |
| 44340.40625 | 5.13 |
| 44340.416666666664 | 5.24 |
| 44340.427083333336 | 5.43 |
| 44340.4375 | 5.52 |
| 44340.447916666664 | 5.64 |
| 44340.458333333336 | 5.69 |
| 44340.46875 | 5.36 |
| 44340.479166666664 | 5.22 |
| 44340.489583333336 | 5.81 |
| 44340.5 | 5.61 |
| 44340.510416666664 | 5.83 |
| 44340.520833333336 | 5.83 |
| 44340.53125 | 5.79 |
| 44340.541666666664 | 5.81 |
| 44340.552083333336 | 5.86 |
| 44340.5625 | 5.93 |
| 44340.572916666664 | 5.98 |
| 44340.583333333336 | 5.99 |
| 44340.59375 | 6.07 |
| 44340.604166666664 | 6.03 |
| 44340.614583333336 | 6.11 |
| 44340.625 | 6.14 |
| 44340.635416666664 | 6.19 |
| 44340.645833333336 | 6.16 |
| 44340.65625 | 6.16 |
| 44340.666666666664 | 6.19 |
| 44340.677083333336 | 6.16 |
| 44340.6875 | 6.12 |
| 44340.697916666664 | 6.15 |
| 44340.708333333336 | 6.14 |
| 44340.71875 | 6.12 |
| 44340.729166666664 | 6.17 |
| 44340.739583333336 | 6.2 |
| 44340.75 | 6.19 |
| 44340.760416666664 | 6.08 |
| 44340.770833333336 | 6.09 |
| 44340.78125 | 6.11 |
| 44340.791666666664 | 6.15 |
| 44340.802083333336 | 6.17 |
| 44340.8125 | 6.24 |
| 44340.822916666664 | 6.29 |
| 44340.833333333336 | 6.36 |
| 44340.84375 | 6.41 |
| 44340.854166666664 | 6.46 |
| 44340.864583333336 | 6.53 |
| 44340.875 | 6.57 |
| 44340.885416666664 | 6.56 |
| 44340.895833333336 | 6.56 |
| 44340.90625 | 6.56 |
| 44340.916666666664 | 6.55 |
| 44340.927083333336 | 6.56 |
| 44340.9375 | 6.52 |
| 44340.947916666664 | 6.54 |
| 44340.958333333336 | 6.52 |
| 44340.96875 | 6.52 |
| 44340.979166666664 | 6.53 |
| 44340.989583333336 | 6.51 |
| 44341.0 | 6.49 |
| 44341.010416666664 | 6.48 |
| 44341.020833333336 | 6.48 |
| 44341.03125 | 6.48 |
| 44341.041666666664 | 6.47 |
| 44341.052083333336 | 6.47 |
| 44341.0625 | 6.48 |
| 44341.072916666664 | 6.45 |
| 44341.083333333336 | 6.44 |
| 44341.09375 | 6.36 |
| 44341.104166666664 | 6.32 |
| 44341.114583333336 | 6.23 |
| 44341.125 | 6.14 |
| 44341.135416666664 | 6.14 |
| 44341.145833333336 | 5.99 |
| 44341.15625 | 5.91 |
| 44341.166666666664 | 5.84 |
| 44341.177083333336 | 5.82 |
| 44341.1875 | 5.78 |
| 44341.197916666664 | 5.74 |
| 44341.208333333336 | 5.72 |
| 44341.21875 | 5.7 |
| 44341.229166666664 | 5.62 |
| 44341.239583333336 | 5.52 |
| 44341.25 | 5.4 |
| 44341.260416666664 | 5.31 |
| 44341.270833333336 | 5.25 |
| 44341.28125 | 5.25 |
| 44341.291666666664 | 5.27 |
| 44341.302083333336 | 5.18 |
| 44341.3125 | 5.25 |
| 44341.322916666664 | 5.3 |
| 44341.333333333336 | 5.4 |
| 44341.34375 | 5.46 |
| 44341.354166666664 | 5.5 |
| 44341.364583333336 | 5.56 |
| 44341.375 | 5.6 |
| 44341.385416666664 | 5.65 |
| 44341.395833333336 | 5.72 |
| 44341.40625 | 5.84 |
| 44341.416666666664 | 5.91 |
| 44341.427083333336 | 5.93 |
| 44341.4375 | 5.97 |
| 44341.447916666664 | 6 |
| 44341.458333333336 | 6.02 |
| 44341.46875 | 6.06 |
| 44341.479166666664 | 6.15 |
| 44341.489583333336 | 6.13 |
| 44341.5 | 6.16 |
| 44341.510416666664 | 6.18 |
| 44341.520833333336 | 6.17 |
| 44341.53125 | 6.25 |
| 44341.541666666664 | 6.2 |
| 44341.552083333336 | 6.21 |
| 44341.5625 | 6.26 |
| 44341.572916666664 | 6.23 |
| 44341.583333333336 | 6.22 |
| 44341.59375 | 6.21 |
| 44341.604166666664 | 6.21 |
| 44341.614583333336 | 6.22 |
| 44341.625 | 6.26 |
| 44341.635416666664 | 6.27 |
| 44341.645833333336 | 6.29 |
| 44341.65625 | 6.34 |
| 44341.666666666664 | 6.46 |
| 44341.677083333336 | 6.51 |
| 44341.6875 | 6.51 |
| 44341.697916666664 | 6.43 |
| 44341.708333333336 | 6.47 |
| 44341.71875 | 6.4 |
| 44341.729166666664 | 6.26 |
| 44341.739583333336 | 6.19 |
| 44341.75 | 6.1 |
| 44341.760416666664 | 6.12 |
| 44341.770833333336 | 6.03 |
| 44341.78125 | 5.97 |
| 44341.791666666664 | 6.06 |
| 44341.802083333336 | 5.95 |
| 44341.8125 | 5.97 |
| 44341.822916666664 | 6.17 |
| 44341.833333333336 | 6.44 |
| 44341.84375 | 6.56 |
| 44341.854166666664 | 6.82 |
| 44341.864583333336 | 6.92 |
| 44341.875 | 7.18 |
| 44341.885416666664 | 7.1 |
| 44341.895833333336 | 6.99 |
| 44341.90625 | 6.82 |
| 44341.916666666664 | 6.62 |
| 44341.927083333336 | 6.52 |
| 44341.9375 | 6.44 |
| 44341.947916666664 | 6.4 |
| 44341.958333333336 | 6.38 |
| 44341.96875 | 6.36 |
| 44341.979166666664 | 6.33 |
| 44341.989583333336 | 6.31 |
| 44342.0 | 6.28 |
| 44342.010416666664 | 6.28 |
| 44342.020833333336 | 6.25 |
| 44342.03125 | 6.23 |
| 44342.041666666664 | 6.28 |
| 44342.052083333336 | 6.24 |
| 44342.0625 | 6.26 |
| 44342.072916666664 | 6.27 |
| 44342.083333333336 | 6.23 |
| 44342.09375 | 6.08 |
| 44342.104166666664 | 6 |
| 44342.114583333336 | 5.93 |
| 44342.125 | 5.84 |
| 44342.135416666664 | 5.71 |
| 44342.145833333336 | 5.65 |
| 44342.15625 | 5.56 |
| 44342.166666666664 | 5.41 |
| 44342.177083333336 | 5.53 |
| 44342.1875 | 5.43 |
| 44342.197916666664 | 5.41 |
| 44342.208333333336 | 5.6 |
| 44342.21875 | 5.51 |
| 44342.229166666664 | 5.51 |
| 44342.239583333336 | 5.46 |
| 44342.25 | 5.42 |
| 44342.260416666664 | 5.35 |
| 44342.270833333336 | 5.22 |
| 44342.28125 | 5.11 |
| 44342.291666666664 | 5 |
| 44342.302083333336 | 4.93 |
| 44342.3125 | 4.9 |
| 44342.322916666664 | 4.85 |
| 44342.333333333336 | 4.94 |
| 44342.34375 | 4.81 |
| 44342.354166666664 | 4.87 |
| 44342.364583333336 | 4.94 |
| 44342.375 | 5.12 |
| 44342.385416666664 | 5.23 |
| 44342.395833333336 | 5.31 |
| 44342.40625 | 5.34 |
| 44342.416666666664 | 5.39 |
| 44342.427083333336 | 5.45 |
| 44342.4375 | 5.5 |
| 44342.447916666664 | 5.52 |
| 44342.458333333336 | 5.55 |
| 44342.46875 | 5.56 |
| 44342.479166666664 | 5.59 |
| 44342.489583333336 | 5.61 |
| 44342.5 | 5.61 |
| 44342.510416666664 | 5.67 |
| 44342.520833333336 | 5.73 |
| 44342.53125 | 5.78 |
| 44342.541666666664 | 5.77 |
| 44342.552083333336 | 5.83 |
| 44342.5625 | 5.62 |
| 44342.572916666664 | 5.84 |
| 44342.583333333336 | 5.97 |
| 44342.59375 | 6.06 |
| 44342.604166666664 | 6.23 |
| 44342.614583333336 | 6.38 |
| 44342.625 | 6.39 |
| 44342.635416666664 | 6.47 |
| 44342.645833333336 | 6.48 |
| 44342.65625 | 6.44 |
| 44342.666666666664 | 6.46 |
| 44342.677083333336 | 6.52 |
| 44342.6875 | 6.61 |
| 44342.697916666664 | 6.64 |
| 44342.708333333336 | 6.67 |
| 44342.71875 | 6.67 |
| 44342.729166666664 | 6.65 |
| 44342.739583333336 | 6.68 |
| 44342.75 | 6.58 |
| 44342.760416666664 | 6.62 |
| 44342.770833333336 | 6.68 |
| 44342.78125 | 6.6 |
| 44342.791666666664 | 6.62 |
| 44342.802083333336 | 6.6 |
| 44342.8125 | 6.53 |
| 44342.822916666664 | 6.59 |
| 44342.833333333336 | 6.37 |
| 44342.84375 | 6.36 |
| 44342.854166666664 | 6.49 |
| 44342.864583333336 | 6.68 |
| 44342.875 | 7.04 |
| 44342.885416666664 | 7.34 |
| 44342.895833333336 | 7.19 |
| 44342.90625 | 6.92 |
| 44342.916666666664 | 6.64 |
| 44342.927083333336 | 6.48 |
| 44342.9375 | 6.37 |
| 44342.947916666664 | 6.36 |
| 44342.958333333336 | 6.37 |
| 44342.96875 | 6.33 |
| 44342.979166666664 | 6.31 |
| 44342.989583333336 | 6.29 |
| 44343.0 | 6.29 |
| 44343.010416666664 | 6.28 |
| 44343.020833333336 | 6.25 |
| 44343.03125 | 6.24 |
| 44343.041666666664 | 6.2 |
| 44343.052083333336 | 6.17 |
| 44343.0625 | 6.22 |
| 44343.072916666664 | 6.11 |
| 44343.083333333336 | 5.99 |
| 44343.09375 | 6.04 |
| 44343.104166666664 | 6.06 |
| 44343.114583333336 | 6.05 |
| 44343.125 | 5.93 |
| 44343.135416666664 | 5.8 |
| 44343.145833333336 | 5.75 |
| 44343.15625 | 5.49 |
| 44343.166666666664 | 5.42 |
| 44343.177083333336 | 5.24 |
| 44343.1875 | 4.9 |
| 44343.197916666664 | 4.68 |
| 44343.208333333336 | 4.67 |
| 44343.21875 | 4.68 |
| 44343.229166666664 | 4.67 |
| 44343.239583333336 | 4.8 |
| 44343.25 | 4.77 |
| 44343.260416666664 | 4.79 |
| 44343.270833333336 | 4.75 |
| 44343.28125 | 4.75 |
| 44343.291666666664 | 4.7 |
| 44343.302083333336 | 4.7 |
| 44343.3125 | 4.62 |
| 44343.322916666664 | 4.58 |
| 44343.333333333336 | 4.59 |
| 44343.34375 | 4.59 |
| 44343.354166666664 | 4.6 |
| 44343.364583333336 | 4.39 |
| 44343.375 | 4.35 |
| 44343.385416666664 | 4.42 |
| 44343.395833333336 | 4.37 |
| 44343.40625 | 4.37 |
| 44343.416666666664 | 4.39 |
| 44343.427083333336 | 4.47 |
| 44343.4375 | 4.47 |
| 44343.447916666664 | 4.45 |
| 44343.458333333336 | 4.44 |
| 44343.46875 | 4.45 |
| 44343.479166666664 | 4.5 |
| 44343.489583333336 | 4.6 |
| 44343.5 | 4.73 |
| 44343.510416666664 | 4.86 |
| 44343.520833333336 | 4.93 |
| 44343.53125 | 5.05 |
| 44343.541666666664 | 5.19 |
| 44343.552083333336 | 5.33 |
| 44343.5625 | 5.26 |
| 44343.572916666664 | 5.36 |
| 44343.583333333336 | 5.41 |
| 44343.59375 | 5.03 |
| 44343.604166666664 | 5.25 |
| 44343.614583333336 | 5.4 |
| 44343.625 | 5.48 |
| 44343.635416666664 | 5.61 |
| 44343.645833333336 | 5.73 |
| 44343.65625 | 5.8 |
| 44343.666666666664 | 5.9 |
| 44343.677083333336 | 5.96 |
| 44343.6875 | 5.93 |
| 44343.697916666664 | 6.01 |
| 44343.708333333336 | 6.03 |
| 44343.71875 | 6.1 |
| 44343.729166666664 | 6.11 |
| 44343.739583333336 | 6.15 |
| 44343.75 | 6.14 |
| 44343.760416666664 | 6.12 |
| 44343.770833333336 | 6.16 |
| 44343.78125 | 6.21 |
| 44343.791666666664 | 6.3 |
| 44343.802083333336 | 6.34 |
| 44343.8125 | 6.32 |
| 44343.822916666664 | 6.33 |
| 44343.833333333336 | 6.47 |
| 44343.84375 | 6.61 |
| 44343.854166666664 | 6.31 |
| 44343.864583333336 | 6.21 |
| 44343.875 | 6.08 |
| 44343.885416666664 | 5.98 |
| 44343.895833333336 | 5.96 |
| 44343.90625 | 6.07 |
| 44343.916666666664 | 6.15 |
| 44343.927083333336 | 6.54 |
| 44343.9375 | 6.85 |
| 44343.947916666664 | 6.89 |
| 44343.958333333336 | 6.95 |
| 44343.96875 | 6.85 |
| 44343.979166666664 | 6.44 |
| 44343.989583333336 | 6.25 |
| 44344.0 | 6.17 |
| 44344.010416666664 | 6.06 |
| 44344.020833333336 | 6.02 |
| 44344.03125 | 5.97 |
| 44344.041666666664 | 5.94 |
| 44344.052083333336 | 5.88 |
| 44344.0625 | 5.86 |
| 44344.072916666664 | 5.84 |
| 44344.083333333336 | 5.77 |
| 44344.09375 | 5.8 |
| 44344.104166666664 | 5.79 |
| 44344.114583333336 | 5.72 |
| 44344.125 | 5.73 |
| 44344.135416666664 | 5.77 |
| 44344.145833333336 | 5.78 |
| 44344.15625 | 5.66 |
| 44344.166666666664 | 5.61 |
| 44344.177083333336 | 5.46 |
| 44344.1875 | 5.33 |
| 44344.197916666664 | 5.24 |
| 44344.208333333336 | 5 |
| 44344.21875 | 5.01 |
| 44344.229166666664 | 4.72 |
| 44344.239583333336 | 4.71 |
| 44344.25 | 4.66 |
| 44344.260416666664 | 4.77 |
| 44344.270833333336 | 4.62 |
| 44344.28125 | 4.78 |
| 44344.291666666664 | 4.75 |
| 44344.302083333336 | 4.69 |
| 44344.3125 | 4.63 |
| 44344.322916666664 | 4.54 |
| 44344.333333333336 | 4.39 |
| 44344.34375 | 4.22 |
| 44344.354166666664 | 4.09 |
| 44344.364583333336 | 3.95 |
| 44344.375 | 3.89 |
| 44344.385416666664 | 3.84 |
| 44344.395833333336 | 3.8 |
| 44344.40625 | 3.77 |
| 44344.416666666664 | 3.79 |
| 44344.427083333336 | 3.83 |
| 44344.4375 | 3.91 |
| 44344.447916666664 | 4.05 |
| 44344.458333333336 | 4.12 |
| 44344.46875 | 4.16 |
| 44344.479166666664 | 4.14 |
| 44344.489583333336 | 4.15 |
| 44344.5 | 4.18 |
| 44344.510416666664 | 4.19 |
| 44344.520833333336 | 4.24 |
| 44344.53125 | 4.33 |
| 44344.541666666664 | 4.53 |
| 44344.552083333336 | 4.63 |
| 44344.5625 | 4.81 |
| 44344.572916666664 | 4.99 |
| 44344.583333333336 | 5.08 |
| 44344.59375 | 5.17 |
| 44344.604166666664 | 5.23 |
| 44344.614583333336 | 5.26 |
| 44344.625 | 5.26 |
| 44344.635416666664 | 5.06 |
| 44344.645833333336 | 5.21 |
| 44344.65625 | 5.5 |
| 44344.666666666664 | 5.71 |
| 44344.677083333336 | 5.79 |
| 44344.6875 | 5.97 |
| 44344.697916666664 | 5.97 |
| 44344.708333333336 | 5.89 |
| 44344.71875 | 6.18 |
| 44344.729166666664 | 6.06 |
| 44344.739583333336 | 6.18 |
| 44344.75 | 6.27 |
| 44344.760416666664 | 6.23 |
| 44344.770833333336 | 6.27 |
| 44344.78125 | 6.39 |
| 44344.791666666664 | 6.44 |
| 44344.802083333336 | 6.45 |
| 44344.8125 | 6.4 |
| 44344.822916666664 | 6.47 |
| 44344.833333333336 | 6.25 |
| 44344.84375 | 6.15 |
| 44344.854166666664 | 6.1 |
| 44344.864583333336 | 6.13 |
| 44344.875 | 6.11 |
| 44344.885416666664 | 6.08 |
| 44344.895833333336 | 6 |
| 44344.90625 | 6 |
| 44344.916666666664 | 5.93 |
| 44344.927083333336 | 5.9 |
| 44344.9375 | 5.97 |
| 44344.947916666664 | 5.94 |
| 44344.958333333336 | 5.9 |
| 44344.96875 | 5.82 |
| 44344.979166666664 | 5.76 |
| 44344.989583333336 | 5.69 |
| 44345.0 | 5.65 |
| 44345.010416666664 | 5.62 |
| 44345.020833333336 | 5.62 |
| 44345.03125 | 5.6 |
| 44345.041666666664 | 5.6 |
| 44345.052083333336 | 5.6 |
| 44345.0625 | 5.6 |
| 44345.072916666664 | 5.59 |
| 44345.083333333336 | 5.53 |
| 44345.09375 | 5.48 |
| 44345.104166666664 | 5.51 |
| 44345.114583333336 | 5.49 |
| 44345.125 | 5.48 |
| 44345.135416666664 | 5.55 |
| 44345.145833333336 | 5.63 |
| 44345.15625 | 5.58 |
| 44345.166666666664 | 5.61 |
| 44345.177083333336 | 5.51 |
| 44345.1875 | 5.64 |
| 44345.197916666664 | 5.44 |
| 44345.208333333336 | 5.3 |
| 44345.21875 | 5.16 |
| 44345.229166666664 | 5.08 |
| 44345.239583333336 | 5 |
| 44345.25 | 4.87 |
| 44345.260416666664 | 4.73 |
| 44345.270833333336 | 4.56 |
| 44345.28125 | 4.49 |
| 44345.291666666664 | 4.33 |
| 44345.302083333336 | 4.16 |
| 44345.3125 | 4.2 |
| 44345.322916666664 | 4.07 |
| 44345.333333333336 | 4.33 |
| 44345.34375 | 4.1 |
| 44345.354166666664 | 4.11 |
| 44345.364583333336 | 4.1 |
| 44345.375 | 4.23 |
| 44345.385416666664 | 4.22 |
| 44345.395833333336 | 4.15 |
| 44345.40625 | 4.1 |
| 44345.416666666664 | 4.05 |
| 44345.427083333336 | 3.98 |
| 44345.4375 | 4.02 |
| 44345.447916666664 | 3.92 |
| 44345.458333333336 | 3.89 |
| 44345.46875 | 3.96 |
| 44345.479166666664 | 4.03 |
| 44345.489583333336 | 4.09 |
| 44345.5 | 4.32 |
| 44345.510416666664 | 4.6 |
| 44345.520833333336 | 4.6 |
| 44345.53125 | 4.62 |
| 44345.541666666664 | 4.72 |
| 44345.552083333336 | 4.84 |
| 44345.5625 | 5.09 |
| 44345.572916666664 | 5.12 |
| 44345.583333333336 | 5.17 |
| 44345.59375 | 5.34 |
| 44345.604166666664 | 5.42 |
| 44345.614583333336 | 5.52 |
| 44345.625 | 5.63 |
| 44345.635416666664 | 5.65 |
| 44345.645833333336 | 5.7 |
| 44345.65625 | 5.78 |
| 44345.666666666664 | 5.52 |
| 44345.677083333336 | 5.32 |
| 44345.6875 | 5.4 |
| 44345.697916666664 | 5.59 |
| 44345.708333333336 | 5.67 |
| 44345.71875 | 5.76 |
| 44345.729166666664 | 5.89 |
| 44345.739583333336 | 5.9 |
| 44345.75 | 5.99 |
| 44345.760416666664 | 5.93 |
| 44345.770833333336 | 6.15 |
| 44345.78125 | 6.3 |
| 44345.791666666664 | 6.2 |
| 44345.802083333336 | 6.31 |
| 44345.8125 | 6.25 |
| 44345.822916666664 | 6.22 |
| 44345.833333333336 | 6.28 |
| 44345.84375 | 6.24 |
| 44345.854166666664 | 6.17 |
| 44345.864583333336 | 6.11 |
| 44345.875 | 6.15 |
| 44345.885416666664 | 6.15 |
| 44345.895833333336 | 6.15 |
| 44345.90625 | 6.13 |
| 44345.916666666664 | 6.11 |
| 44345.927083333336 | 6.03 |
| 44345.9375 | 5.95 |
| 44345.947916666664 | 5.93 |
| 44345.958333333336 | 5.95 |
| 44345.96875 | 5.88 |
| 44345.979166666664 | 5.86 |
| 44345.989583333336 | 5.88 |
| 44346.0 | 5.94 |
| 44346.010416666664 | 6.11 |
| 44346.020833333336 | 6.2 |
| 44346.03125 | 6.36 |
| 44346.041666666664 | 6.41 |
| 44346.052083333336 | 6.5 |
| 44346.0625 | 6.51 |
| 44346.072916666664 | 6.59 |
| 44346.083333333336 | 6.63 |
| 44346.09375 | 6.67 |
| 44346.104166666664 | 6.7 |
| 44346.114583333336 | 6.75 |
| 44346.125 | 6.75 |
| 44346.135416666664 | 6.76 |
| 44346.145833333336 | 6.77 |
| 44346.15625 | 6.77 |
| 44346.166666666664 | 6.61 |
| 44346.177083333336 | 6.66 |
| 44346.1875 | 6.63 |
| 44346.197916666664 | 6.62 |
| 44346.208333333336 | 6.59 |
| 44346.21875 | 6.59 |
| 44346.229166666664 | 6.59 |
| 44346.239583333336 | 6.57 |
| 44346.25 | 6.53 |
| 44346.260416666664 | 6.53 |
| 44346.270833333336 | 6.53 |
| 44346.28125 | 6.47 |
| 44346.291666666664 | 6.44 |
| 44346.302083333336 | 6.43 |
| 44346.3125 | 6.52 |
| 44346.322916666664 | 6.55 |
| 44346.333333333336 | 6.63 |
| 44346.34375 | 6.54 |
| 44346.354166666664 | 6.58 |
| 44346.364583333336 | 6.57 |
| 44346.375 | 6.45 |
| 44346.385416666664 | 6.51 |
| 44346.395833333336 | 6.33 |
| 44346.40625 | 6.28 |
| 44346.416666666664 | 6.16 |
| 44346.427083333336 | 6.18 |
| 44346.4375 | 6.24 |
| 44346.447916666664 | 6.17 |
| 44346.458333333336 | 6.16 |
| 44346.46875 | 6.14 |
| 44346.479166666664 | 6.11 |
| 44346.489583333336 | 6.02 |
| 44346.5 | 5.89 |
| 44346.510416666664 | 6.09 |
| 44346.520833333336 | 6.06 |
| 44346.53125 | 6.11 |
| 44346.541666666664 | 6.22 |
| 44346.552083333336 | 6.37 |
| 44346.5625 | 6.55 |
| 44346.572916666664 | 6.7 |
| 44346.583333333336 | 6.82 |
| 44346.59375 | 6.83 |
| 44346.604166666664 | 6.86 |
| 44346.614583333336 | 6.88 |
| 44346.625 | 6.88 |
| 44346.635416666664 | 6.87 |
| 44346.645833333336 | 6.89 |
| 44346.65625 | 6.89 |
| 44346.666666666664 | 6.88 |
| 44346.677083333336 | 6.87 |
| 44346.6875 | 6.89 |
| 44346.697916666664 | 6.9 |
| 44346.708333333336 | 6.87 |
| 44346.71875 | 6.78 |
| 44346.729166666664 | 6.82 |
| 44346.739583333336 | 7.06 |
| 44346.75 | 7.01 |
| 44346.760416666664 | 7.05 |
| 44346.770833333336 | 7.06 |
| 44346.78125 | 7.02 |
| 44346.791666666664 | 7.06 |
| 44346.802083333336 | 7.06 |
| 44346.8125 | 7.07 |
| 44346.822916666664 | 7.11 |
| 44346.833333333336 | 7.11 |
| 44346.84375 | 7.09 |
| 44346.854166666664 | 7.1 |
| 44346.864583333336 | 7.02 |
| 44346.875 | 7.06 |
| 44346.885416666664 | 7.08 |
| 44346.895833333336 | 7.07 |
| 44346.90625 | 7.08 |
| 44346.916666666664 | 7.08 |
| 44346.927083333336 | 7.09 |
| 44346.9375 | 7.03 |
| 44346.947916666664 | 6.82 |
| 44346.958333333336 | 6.75 |
| 44346.96875 | 6.39 |
| 44346.979166666664 | 6.53 |
| 44346.989583333336 | 6.6 |
| 44347.0 | 6.57 |
| 44347.010416666664 | 6.6 |
| 44347.020833333336 | 6.66 |
| 44347.03125 | 6.79 |
| 44347.041666666664 | 6.88 |
| 44347.052083333336 | 6.93 |
| 44347.0625 | 6.9 |
| 44347.072916666664 | 6.88 |
| 44347.083333333336 | 6.89 |
| 44347.09375 | 6.87 |
| 44347.104166666664 | 6.85 |
| 44347.114583333336 | 6.84 |
| 44347.125 | 6.83 |
| 44347.135416666664 | 6.82 |
| 44347.145833333336 | 6.86 |
| 44347.15625 | 6.84 |
| 44347.166666666664 | 6.87 |
| 44347.177083333336 | 6.86 |
| 44347.1875 | 6.88 |
| 44347.197916666664 | 6.88 |
| 44347.208333333336 | 6.84 |
| 44347.21875 | 6.85 |
| 44347.229166666664 | 6.84 |
| 44347.239583333336 | 6.68 |
| 44347.25 | 6.73 |
| 44347.260416666664 | 6.74 |
| 44347.270833333336 | 6.65 |
| 44347.28125 | 6.56 |
| 44347.291666666664 | 6.52 |
| 44347.302083333336 | 6.49 |
| 44347.3125 | 6.43 |
| 44347.322916666664 | 6.35 |
| 44347.333333333336 | 6.23 |
| 44347.34375 | 6.17 |
| 44347.354166666664 | 5.95 |
| 44347.364583333336 | 5.8 |
| 44347.375 | 5.76 |
| 44347.385416666664 | 5.49 |
| 44347.395833333336 | 5.4 |
| 44347.40625 | 5.37 |
| 44347.416666666664 | 5.4 |
| 44347.427083333336 | 5.57 |
| 44347.4375 | 5.51 |
| 44347.447916666664 | 5.66 |
| 44347.458333333336 | 5.64 |
| 44347.46875 | 5.6 |
| 44347.479166666664 | 5.61 |
| 44347.489583333336 | 5.58 |
| 44347.5 | 5.58 |
| 44347.510416666664 | 5.46 |
| 44347.520833333336 | 5.49 |
| 44347.53125 | 5.51 |
| 44347.541666666664 | 5.48 |
| 44347.552083333336 | 5.52 |
| 44347.5625 | 5.63 |
| 44347.572916666664 | 5.69 |
| 44347.583333333336 | 5.88 |
| 44347.59375 | 6.05 |
| 44347.604166666664 | 6.28 |
| 44347.614583333336 | 6.37 |
| 44347.625 | 6.47 |
| 44347.635416666664 | 6.52 |
| 44347.645833333336 | 6.58 |
| 44347.65625 | 6.68 |
| 44347.666666666664 | 6.71 |
| 44347.677083333336 | 6.73 |
| 44347.6875 | 6.74 |
| 44347.697916666664 | 6.75 |
| 44347.708333333336 | 6.82 |
| 44347.71875 | 6.87 |
| 44347.729166666664 | 6.93 |
| 44347.739583333336 | 6.85 |
| 44347.75 | 6.87 |
| 44347.760416666664 | 6.81 |
| 44347.770833333336 | 7.15 |
| 44347.78125 | 7.24 |
| 44347.791666666664 | 7.37 |
| 44347.802083333336 | 7.49 |
| 44347.8125 | 7.58 |
| 44347.822916666664 | 7.67 |
| 44347.833333333336 | 7.72 |
| 44347.84375 | 7.82 |
| 44347.854166666664 | 7.76 |
| 44347.864583333336 | 7.79 |
| 44347.875 | 7.73 |
| 44347.885416666664 | 7.72 |
| 44347.895833333336 | 7.72 |
| 44347.90625 | 7.74 |
| 44347.916666666664 | 7.76 |
| 44347.927083333336 | 7.77 |
| 44347.9375 | 7.74 |
| 44347.947916666664 | 7.73 |
| 44347.958333333336 | 7.63 |
| 44347.96875 | 7.45 |
| 44347.979166666664 | 7.33 |
| 44347.989583333336 | 7.26 |
| 44348.0 | 7.13 |
| 44348.010416666664 | 7.15 |
| 44348.020833333336 | 7.11 |
| 44348.03125 | 7.06 |
| 44348.041666666664 | 7.01 |
| 44348.052083333336 | 7.07 |
| 44348.0625 | 7.13 |
| 44348.072916666664 | 7.14 |
| 44348.083333333336 | 7.19 |
| 44348.09375 | 7.17 |
| 44348.104166666664 | 7.11 |
| 44348.114583333336 | 7.01 |
| 44348.125 | 6.94 |
| 44348.135416666664 | 6.88 |
| 44348.145833333336 | 6.84 |
| 44348.15625 | 6.81 |